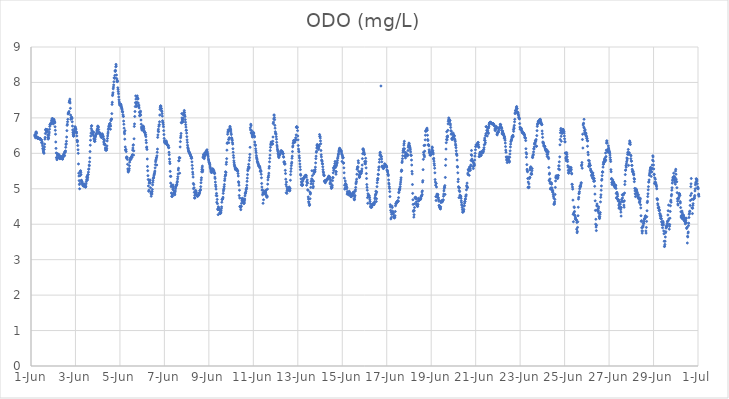
| Category | ODO (mg/L) |
|---|---|
| 45078.166666666664 | 6.49 |
| 45078.177083333336 | 6.53 |
| 45078.1875 | 6.51 |
| 45078.197916666664 | 6.44 |
| 45078.208333333336 | 6.49 |
| 45078.21875 | 6.6 |
| 45078.229166666664 | 6.59 |
| 45078.239583333336 | 6.6 |
| 45078.25 | 6.56 |
| 45078.260416666664 | 6.47 |
| 45078.270833333336 | 6.44 |
| 45078.28125 | 6.43 |
| 45078.291666666664 | 6.43 |
| 45078.302083333336 | 6.43 |
| 45078.3125 | 6.42 |
| 45078.322916666664 | 6.44 |
| 45078.333333333336 | 6.43 |
| 45078.34375 | 6.42 |
| 45078.354166666664 | 6.43 |
| 45078.364583333336 | 6.42 |
| 45078.375 | 6.42 |
| 45078.385416666664 | 6.41 |
| 45078.395833333336 | 6.4 |
| 45078.40625 | 6.42 |
| 45078.416666666664 | 6.41 |
| 45078.427083333336 | 6.41 |
| 45078.4375 | 6.39 |
| 45078.447916666664 | 6.39 |
| 45078.458333333336 | 6.38 |
| 45078.46875 | 6.37 |
| 45078.479166666664 | 6.3 |
| 45078.489583333336 | 6.31 |
| 45078.5 | 6.32 |
| 45078.510416666664 | 6.27 |
| 45078.520833333336 | 6.21 |
| 45078.53125 | 6.14 |
| 45078.541666666664 | 6.12 |
| 45078.552083333336 | 6.07 |
| 45078.5625 | 6.04 |
| 45078.572916666664 | 6.02 |
| 45078.583333333336 | 6 |
| 45078.59375 | 6.11 |
| 45078.604166666664 | 6.18 |
| 45078.614583333336 | 6.26 |
| 45078.625 | 6.4 |
| 45078.635416666664 | 6.45 |
| 45078.645833333336 | 6.56 |
| 45078.65625 | 6.66 |
| 45078.666666666664 | 6.68 |
| 45078.677083333336 | 6.67 |
| 45078.6875 | 6.65 |
| 45078.697916666664 | 6.61 |
| 45078.708333333336 | 6.61 |
| 45078.71875 | 6.62 |
| 45078.729166666664 | 6.67 |
| 45078.739583333336 | 6.65 |
| 45078.75 | 6.52 |
| 45078.760416666664 | 6.45 |
| 45078.770833333336 | 6.4 |
| 45078.78125 | 6.42 |
| 45078.791666666664 | 6.43 |
| 45078.802083333336 | 6.5 |
| 45078.8125 | 6.55 |
| 45078.822916666664 | 6.6 |
| 45078.833333333336 | 6.68 |
| 45078.84375 | 6.76 |
| 45078.854166666664 | 6.81 |
| 45078.864583333336 | 6.82 |
| 45078.875 | 6.81 |
| 45078.885416666664 | 6.84 |
| 45078.895833333336 | 6.85 |
| 45078.90625 | 6.85 |
| 45078.916666666664 | 6.87 |
| 45078.927083333336 | 6.92 |
| 45078.9375 | 6.94 |
| 45078.947916666664 | 6.97 |
| 45078.958333333336 | 6.98 |
| 45078.96875 | 6.98 |
| 45078.979166666664 | 6.97 |
| 45078.989583333336 | 6.9 |
| 45079.0 | 6.83 |
| 45079.010416666664 | 6.85 |
| 45079.020833333336 | 6.95 |
| 45079.03125 | 6.96 |
| 45079.041666666664 | 6.92 |
| 45079.052083333336 | 6.89 |
| 45079.0625 | 6.89 |
| 45079.072916666664 | 6.86 |
| 45079.083333333336 | 6.75 |
| 45079.09375 | 6.65 |
| 45079.104166666664 | 6.54 |
| 45079.114583333336 | 6.32 |
| 45079.125 | 6.14 |
| 45079.135416666664 | 6.01 |
| 45079.145833333336 | 5.88 |
| 45079.15625 | 5.88 |
| 45079.166666666664 | 5.82 |
| 45079.177083333336 | 5.86 |
| 45079.1875 | 5.95 |
| 45079.197916666664 | 5.99 |
| 45079.208333333336 | 5.96 |
| 45079.21875 | 5.97 |
| 45079.229166666664 | 5.89 |
| 45079.239583333336 | 5.96 |
| 45079.25 | 5.95 |
| 45079.260416666664 | 5.96 |
| 45079.270833333336 | 5.87 |
| 45079.28125 | 5.89 |
| 45079.291666666664 | 5.85 |
| 45079.302083333336 | 5.86 |
| 45079.3125 | 5.85 |
| 45079.322916666664 | 5.87 |
| 45079.333333333336 | 5.9 |
| 45079.34375 | 5.91 |
| 45079.354166666664 | 5.91 |
| 45079.364583333336 | 5.89 |
| 45079.375 | 5.86 |
| 45079.385416666664 | 5.85 |
| 45079.395833333336 | 5.85 |
| 45079.40625 | 5.85 |
| 45079.416666666664 | 5.84 |
| 45079.427083333336 | 5.84 |
| 45079.4375 | 5.88 |
| 45079.447916666664 | 5.91 |
| 45079.458333333336 | 5.94 |
| 45079.46875 | 5.96 |
| 45079.479166666664 | 5.98 |
| 45079.489583333336 | 6 |
| 45079.5 | 5.93 |
| 45079.510416666664 | 5.94 |
| 45079.520833333336 | 6.04 |
| 45079.53125 | 6.05 |
| 45079.541666666664 | 6.03 |
| 45079.552083333336 | 6.07 |
| 45079.5625 | 6.17 |
| 45079.572916666664 | 6.25 |
| 45079.583333333336 | 6.27 |
| 45079.59375 | 6.34 |
| 45079.604166666664 | 6.46 |
| 45079.614583333336 | 6.64 |
| 45079.625 | 6.79 |
| 45079.635416666664 | 6.82 |
| 45079.645833333336 | 6.89 |
| 45079.65625 | 6.96 |
| 45079.666666666664 | 7.11 |
| 45079.677083333336 | 7.14 |
| 45079.6875 | 7.13 |
| 45079.697916666664 | 7.14 |
| 45079.708333333336 | 7.18 |
| 45079.71875 | 7.44 |
| 45079.729166666664 | 7.48 |
| 45079.739583333336 | 7.46 |
| 45079.75 | 7.53 |
| 45079.760416666664 | 7.42 |
| 45079.770833333336 | 7.27 |
| 45079.78125 | 7.08 |
| 45079.791666666664 | 6.96 |
| 45079.802083333336 | 7 |
| 45079.8125 | 7 |
| 45079.822916666664 | 7.02 |
| 45079.833333333336 | 7.01 |
| 45079.84375 | 6.98 |
| 45079.854166666664 | 6.89 |
| 45079.864583333336 | 6.77 |
| 45079.875 | 6.66 |
| 45079.885416666664 | 6.59 |
| 45079.895833333336 | 6.54 |
| 45079.90625 | 6.49 |
| 45079.916666666664 | 6.49 |
| 45079.927083333336 | 6.49 |
| 45079.9375 | 6.55 |
| 45079.947916666664 | 6.6 |
| 45079.958333333336 | 6.63 |
| 45079.96875 | 6.7 |
| 45079.979166666664 | 6.75 |
| 45079.989583333336 | 6.74 |
| 45080.0 | 6.71 |
| 45080.010416666664 | 6.69 |
| 45080.020833333336 | 6.68 |
| 45080.03125 | 6.61 |
| 45080.041666666664 | 6.6 |
| 45080.052083333336 | 6.57 |
| 45080.0625 | 6.49 |
| 45080.072916666664 | 6.37 |
| 45080.083333333336 | 6.32 |
| 45080.09375 | 6.35 |
| 45080.104166666664 | 6.22 |
| 45080.114583333336 | 6.1 |
| 45080.125 | 6 |
| 45080.135416666664 | 5.7 |
| 45080.145833333336 | 5.44 |
| 45080.15625 | 5.36 |
| 45080.166666666664 | 5.23 |
| 45080.177083333336 | 5.12 |
| 45080.1875 | 5 |
| 45080.197916666664 | 5.15 |
| 45080.208333333336 | 5.37 |
| 45080.21875 | 5.49 |
| 45080.229166666664 | 5.51 |
| 45080.239583333336 | 5.46 |
| 45080.25 | 5.4 |
| 45080.260416666664 | 5.23 |
| 45080.270833333336 | 5.24 |
| 45080.28125 | 5.21 |
| 45080.291666666664 | 5.18 |
| 45080.302083333336 | 5.19 |
| 45080.3125 | 5.14 |
| 45080.322916666664 | 5.12 |
| 45080.333333333336 | 5.09 |
| 45080.34375 | 5.11 |
| 45080.354166666664 | 5.1 |
| 45080.364583333336 | 5.07 |
| 45080.375 | 5.12 |
| 45080.385416666664 | 5.13 |
| 45080.395833333336 | 5.13 |
| 45080.40625 | 5.1 |
| 45080.416666666664 | 5.08 |
| 45080.427083333336 | 5.08 |
| 45080.4375 | 5.06 |
| 45080.447916666664 | 5.05 |
| 45080.458333333336 | 5.05 |
| 45080.46875 | 5.07 |
| 45080.479166666664 | 5.14 |
| 45080.489583333336 | 5.2 |
| 45080.5 | 5.25 |
| 45080.510416666664 | 5.31 |
| 45080.520833333336 | 5.35 |
| 45080.53125 | 5.35 |
| 45080.541666666664 | 5.25 |
| 45080.552083333336 | 5.31 |
| 45080.5625 | 5.4 |
| 45080.572916666664 | 5.4 |
| 45080.583333333336 | 5.47 |
| 45080.59375 | 5.55 |
| 45080.604166666664 | 5.56 |
| 45080.614583333336 | 5.67 |
| 45080.625 | 5.65 |
| 45080.635416666664 | 5.76 |
| 45080.645833333336 | 5.87 |
| 45080.65625 | 6.05 |
| 45080.666666666664 | 6.23 |
| 45080.677083333336 | 6.37 |
| 45080.6875 | 6.49 |
| 45080.697916666664 | 6.57 |
| 45080.708333333336 | 6.7 |
| 45080.71875 | 6.77 |
| 45080.729166666664 | 6.78 |
| 45080.739583333336 | 6.65 |
| 45080.75 | 6.62 |
| 45080.760416666664 | 6.55 |
| 45080.770833333336 | 6.54 |
| 45080.78125 | 6.55 |
| 45080.791666666664 | 6.55 |
| 45080.802083333336 | 6.59 |
| 45080.8125 | 6.6 |
| 45080.822916666664 | 6.49 |
| 45080.833333333336 | 6.42 |
| 45080.84375 | 6.39 |
| 45080.854166666664 | 6.34 |
| 45080.864583333336 | 6.34 |
| 45080.875 | 6.34 |
| 45080.885416666664 | 6.4 |
| 45080.895833333336 | 6.46 |
| 45080.90625 | 6.49 |
| 45080.916666666664 | 6.52 |
| 45080.927083333336 | 6.54 |
| 45080.9375 | 6.54 |
| 45080.947916666664 | 6.56 |
| 45080.958333333336 | 6.6 |
| 45080.96875 | 6.65 |
| 45080.979166666664 | 6.66 |
| 45080.989583333336 | 6.7 |
| 45081.0 | 6.76 |
| 45081.010416666664 | 6.77 |
| 45081.020833333336 | 6.74 |
| 45081.03125 | 6.74 |
| 45081.041666666664 | 6.67 |
| 45081.052083333336 | 6.6 |
| 45081.0625 | 6.56 |
| 45081.072916666664 | 6.58 |
| 45081.083333333336 | 6.57 |
| 45081.09375 | 6.58 |
| 45081.104166666664 | 6.56 |
| 45081.114583333336 | 6.55 |
| 45081.125 | 6.53 |
| 45081.135416666664 | 6.5 |
| 45081.145833333336 | 6.48 |
| 45081.15625 | 6.46 |
| 45081.166666666664 | 6.45 |
| 45081.177083333336 | 6.45 |
| 45081.1875 | 6.47 |
| 45081.197916666664 | 6.55 |
| 45081.208333333336 | 6.54 |
| 45081.21875 | 6.52 |
| 45081.229166666664 | 6.5 |
| 45081.239583333336 | 6.46 |
| 45081.25 | 6.47 |
| 45081.260416666664 | 6.4 |
| 45081.270833333336 | 6.32 |
| 45081.28125 | 6.26 |
| 45081.291666666664 | 6.39 |
| 45081.302083333336 | 6.35 |
| 45081.3125 | 6.27 |
| 45081.322916666664 | 6.25 |
| 45081.333333333336 | 6.23 |
| 45081.34375 | 6.15 |
| 45081.354166666664 | 6.09 |
| 45081.364583333336 | 6.11 |
| 45081.375 | 6.13 |
| 45081.385416666664 | 6.09 |
| 45081.395833333336 | 6.09 |
| 45081.40625 | 6.14 |
| 45081.416666666664 | 6.21 |
| 45081.427083333336 | 6.35 |
| 45081.4375 | 6.42 |
| 45081.447916666664 | 6.49 |
| 45081.458333333336 | 6.55 |
| 45081.46875 | 6.6 |
| 45081.479166666664 | 6.67 |
| 45081.489583333336 | 6.7 |
| 45081.5 | 6.75 |
| 45081.510416666664 | 6.77 |
| 45081.520833333336 | 6.78 |
| 45081.53125 | 6.81 |
| 45081.541666666664 | 6.84 |
| 45081.552083333336 | 6.84 |
| 45081.5625 | 6.8 |
| 45081.572916666664 | 6.68 |
| 45081.583333333336 | 6.77 |
| 45081.59375 | 6.92 |
| 45081.604166666664 | 6.95 |
| 45081.614583333336 | 6.96 |
| 45081.625 | 6.97 |
| 45081.635416666664 | 7.12 |
| 45081.645833333336 | 7.38 |
| 45081.65625 | 7.44 |
| 45081.666666666664 | 7.63 |
| 45081.677083333336 | 7.67 |
| 45081.6875 | 7.71 |
| 45081.697916666664 | 7.82 |
| 45081.708333333336 | 7.87 |
| 45081.71875 | 7.93 |
| 45081.729166666664 | 8.02 |
| 45081.739583333336 | 8.13 |
| 45081.75 | 8.12 |
| 45081.760416666664 | 8.13 |
| 45081.770833333336 | 8.2 |
| 45081.78125 | 8.33 |
| 45081.791666666664 | 8.31 |
| 45081.802083333336 | 8.34 |
| 45081.8125 | 8.44 |
| 45081.822916666664 | 8.51 |
| 45081.833333333336 | 8.46 |
| 45081.84375 | 8.21 |
| 45081.854166666664 | 8.11 |
| 45081.864583333336 | 8.07 |
| 45081.875 | 8.02 |
| 45081.885416666664 | 8.04 |
| 45081.895833333336 | 8.03 |
| 45081.90625 | 7.85 |
| 45081.916666666664 | 7.8 |
| 45081.927083333336 | 7.74 |
| 45081.9375 | 7.68 |
| 45081.947916666664 | 7.59 |
| 45081.958333333336 | 7.51 |
| 45081.96875 | 7.45 |
| 45081.979166666664 | 7.41 |
| 45081.989583333336 | 7.37 |
| 45082.0 | 7.36 |
| 45082.010416666664 | 7.36 |
| 45082.020833333336 | 7.37 |
| 45082.03125 | 7.39 |
| 45082.041666666664 | 7.38 |
| 45082.052083333336 | 7.35 |
| 45082.0625 | 7.32 |
| 45082.072916666664 | 7.29 |
| 45082.083333333336 | 7.27 |
| 45082.09375 | 7.24 |
| 45082.104166666664 | 7.19 |
| 45082.114583333336 | 7.17 |
| 45082.125 | 7.17 |
| 45082.135416666664 | 7.09 |
| 45082.145833333336 | 7.05 |
| 45082.15625 | 7.04 |
| 45082.166666666664 | 6.91 |
| 45082.177083333336 | 6.82 |
| 45082.1875 | 6.71 |
| 45082.197916666664 | 6.6 |
| 45082.208333333336 | 6.55 |
| 45082.21875 | 6.4 |
| 45082.229166666664 | 6.64 |
| 45082.239583333336 | 6.18 |
| 45082.25 | 6.1 |
| 45082.260416666664 | 6.09 |
| 45082.270833333336 | 6.11 |
| 45082.28125 | 6.05 |
| 45082.291666666664 | 5.87 |
| 45082.302083333336 | 5.9 |
| 45082.3125 | 5.88 |
| 45082.322916666664 | 5.89 |
| 45082.333333333336 | 5.83 |
| 45082.34375 | 5.69 |
| 45082.354166666664 | 5.56 |
| 45082.364583333336 | 5.5 |
| 45082.375 | 5.47 |
| 45082.385416666664 | 5.54 |
| 45082.395833333336 | 5.54 |
| 45082.40625 | 5.51 |
| 45082.416666666664 | 5.57 |
| 45082.427083333336 | 5.65 |
| 45082.4375 | 5.75 |
| 45082.447916666664 | 5.8 |
| 45082.458333333336 | 5.86 |
| 45082.46875 | 5.84 |
| 45082.479166666664 | 5.84 |
| 45082.489583333336 | 5.83 |
| 45082.5 | 5.85 |
| 45082.510416666664 | 5.89 |
| 45082.520833333336 | 5.91 |
| 45082.53125 | 5.89 |
| 45082.541666666664 | 5.89 |
| 45082.552083333336 | 5.95 |
| 45082.5625 | 5.96 |
| 45082.572916666664 | 6.09 |
| 45082.583333333336 | 6.15 |
| 45082.59375 | 6.23 |
| 45082.604166666664 | 6.24 |
| 45082.614583333336 | 5.95 |
| 45082.625 | 6.07 |
| 45082.635416666664 | 6.41 |
| 45082.645833333336 | 6.76 |
| 45082.65625 | 6.83 |
| 45082.666666666664 | 7.04 |
| 45082.677083333336 | 7.18 |
| 45082.6875 | 7.32 |
| 45082.697916666664 | 7.43 |
| 45082.708333333336 | 7.62 |
| 45082.71875 | 7.53 |
| 45082.729166666664 | 7.42 |
| 45082.739583333336 | 7.37 |
| 45082.75 | 7.32 |
| 45082.760416666664 | 7.44 |
| 45082.770833333336 | 7.58 |
| 45082.78125 | 7.62 |
| 45082.791666666664 | 7.56 |
| 45082.802083333336 | 7.53 |
| 45082.8125 | 7.54 |
| 45082.822916666664 | 7.42 |
| 45082.833333333336 | 7.34 |
| 45082.84375 | 7.33 |
| 45082.854166666664 | 7.36 |
| 45082.864583333336 | 7.28 |
| 45082.875 | 7.16 |
| 45082.885416666664 | 7.06 |
| 45082.895833333336 | 7.07 |
| 45082.90625 | 7.11 |
| 45082.916666666664 | 7.16 |
| 45082.927083333336 | 7.19 |
| 45082.9375 | 7.08 |
| 45082.947916666664 | 6.94 |
| 45082.958333333336 | 6.82 |
| 45082.96875 | 6.74 |
| 45082.979166666664 | 6.7 |
| 45082.989583333336 | 6.68 |
| 45083.0 | 6.65 |
| 45083.010416666664 | 6.67 |
| 45083.020833333336 | 6.72 |
| 45083.03125 | 6.76 |
| 45083.041666666664 | 6.77 |
| 45083.052083333336 | 6.76 |
| 45083.0625 | 6.74 |
| 45083.072916666664 | 6.7 |
| 45083.083333333336 | 6.65 |
| 45083.09375 | 6.62 |
| 45083.104166666664 | 6.59 |
| 45083.114583333336 | 6.59 |
| 45083.125 | 6.59 |
| 45083.135416666664 | 6.58 |
| 45083.145833333336 | 6.52 |
| 45083.15625 | 6.53 |
| 45083.166666666664 | 6.47 |
| 45083.177083333336 | 6.37 |
| 45083.1875 | 6.3 |
| 45083.197916666664 | 6.16 |
| 45083.208333333336 | 6.18 |
| 45083.21875 | 6.11 |
| 45083.229166666664 | 5.84 |
| 45083.239583333336 | 5.63 |
| 45083.25 | 5.51 |
| 45083.260416666664 | 5.37 |
| 45083.270833333336 | 5.26 |
| 45083.28125 | 5.08 |
| 45083.291666666664 | 4.93 |
| 45083.302083333336 | 4.96 |
| 45083.3125 | 5.16 |
| 45083.322916666664 | 5.19 |
| 45083.333333333336 | 5.23 |
| 45083.34375 | 5.24 |
| 45083.354166666664 | 5.25 |
| 45083.364583333336 | 5.16 |
| 45083.375 | 5.03 |
| 45083.385416666664 | 4.91 |
| 45083.395833333336 | 4.86 |
| 45083.40625 | 4.79 |
| 45083.416666666664 | 4.91 |
| 45083.427083333336 | 4.87 |
| 45083.4375 | 4.85 |
| 45083.447916666664 | 4.92 |
| 45083.458333333336 | 4.98 |
| 45083.46875 | 5.11 |
| 45083.479166666664 | 5.18 |
| 45083.489583333336 | 5.23 |
| 45083.5 | 5.29 |
| 45083.510416666664 | 5.31 |
| 45083.520833333336 | 5.33 |
| 45083.53125 | 5.38 |
| 45083.541666666664 | 5.41 |
| 45083.552083333336 | 5.43 |
| 45083.5625 | 5.47 |
| 45083.572916666664 | 5.5 |
| 45083.583333333336 | 5.59 |
| 45083.59375 | 5.68 |
| 45083.604166666664 | 5.76 |
| 45083.614583333336 | 5.8 |
| 45083.625 | 5.83 |
| 45083.635416666664 | 5.87 |
| 45083.645833333336 | 5.88 |
| 45083.65625 | 5.67 |
| 45083.666666666664 | 5.93 |
| 45083.677083333336 | 6.03 |
| 45083.6875 | 6.12 |
| 45083.697916666664 | 6.45 |
| 45083.708333333336 | 6.52 |
| 45083.71875 | 6.63 |
| 45083.729166666664 | 6.68 |
| 45083.739583333336 | 6.61 |
| 45083.75 | 6.76 |
| 45083.760416666664 | 6.8 |
| 45083.770833333336 | 6.81 |
| 45083.78125 | 6.89 |
| 45083.791666666664 | 7.08 |
| 45083.802083333336 | 7.24 |
| 45083.8125 | 7.3 |
| 45083.822916666664 | 7.33 |
| 45083.833333333336 | 7.34 |
| 45083.84375 | 7.33 |
| 45083.854166666664 | 7.27 |
| 45083.864583333336 | 7.26 |
| 45083.875 | 7.2 |
| 45083.885416666664 | 7.18 |
| 45083.895833333336 | 7.12 |
| 45083.90625 | 7.05 |
| 45083.916666666664 | 6.92 |
| 45083.927083333336 | 6.88 |
| 45083.9375 | 6.86 |
| 45083.947916666664 | 6.81 |
| 45083.958333333336 | 6.75 |
| 45083.96875 | 6.64 |
| 45083.979166666664 | 6.53 |
| 45083.989583333336 | 6.42 |
| 45084.0 | 6.35 |
| 45084.010416666664 | 6.32 |
| 45084.020833333336 | 6.31 |
| 45084.03125 | 6.29 |
| 45084.041666666664 | 6.28 |
| 45084.052083333336 | 6.31 |
| 45084.0625 | 6.35 |
| 45084.072916666664 | 6.35 |
| 45084.083333333336 | 6.34 |
| 45084.09375 | 6.31 |
| 45084.104166666664 | 6.29 |
| 45084.114583333336 | 6.26 |
| 45084.125 | 6.25 |
| 45084.135416666664 | 6.23 |
| 45084.145833333336 | 6.23 |
| 45084.15625 | 6.22 |
| 45084.166666666664 | 6.23 |
| 45084.177083333336 | 6.21 |
| 45084.1875 | 6.16 |
| 45084.197916666664 | 6.16 |
| 45084.208333333336 | 6.03 |
| 45084.21875 | 5.96 |
| 45084.229166666664 | 5.84 |
| 45084.239583333336 | 5.76 |
| 45084.25 | 5.71 |
| 45084.260416666664 | 5.49 |
| 45084.270833333336 | 5.35 |
| 45084.28125 | 5.16 |
| 45084.291666666664 | 5.35 |
| 45084.302083333336 | 5.06 |
| 45084.3125 | 4.88 |
| 45084.322916666664 | 5.1 |
| 45084.333333333336 | 4.79 |
| 45084.34375 | 4.78 |
| 45084.354166666664 | 4.85 |
| 45084.364583333336 | 4.8 |
| 45084.375 | 4.99 |
| 45084.385416666664 | 5.11 |
| 45084.395833333336 | 5.06 |
| 45084.40625 | 5.02 |
| 45084.416666666664 | 4.95 |
| 45084.427083333336 | 4.89 |
| 45084.4375 | 4.85 |
| 45084.447916666664 | 4.87 |
| 45084.458333333336 | 4.86 |
| 45084.46875 | 4.83 |
| 45084.479166666664 | 4.91 |
| 45084.489583333336 | 4.94 |
| 45084.5 | 5 |
| 45084.510416666664 | 5.05 |
| 45084.520833333336 | 5.07 |
| 45084.53125 | 5.09 |
| 45084.541666666664 | 5.1 |
| 45084.552083333336 | 5.11 |
| 45084.5625 | 5.13 |
| 45084.572916666664 | 5.18 |
| 45084.583333333336 | 5.21 |
| 45084.59375 | 5.28 |
| 45084.604166666664 | 5.34 |
| 45084.614583333336 | 5.42 |
| 45084.625 | 5.53 |
| 45084.635416666664 | 5.58 |
| 45084.645833333336 | 5.79 |
| 45084.65625 | 5.79 |
| 45084.666666666664 | 5.88 |
| 45084.677083333336 | 5.87 |
| 45084.6875 | 5.44 |
| 45084.697916666664 | 5.87 |
| 45084.708333333336 | 6.18 |
| 45084.71875 | 6.33 |
| 45084.729166666664 | 6.44 |
| 45084.739583333336 | 6.49 |
| 45084.75 | 6.56 |
| 45084.760416666664 | 6.87 |
| 45084.770833333336 | 6.86 |
| 45084.78125 | 7.12 |
| 45084.791666666664 | 7 |
| 45084.802083333336 | 6.94 |
| 45084.8125 | 6.95 |
| 45084.822916666664 | 6.88 |
| 45084.833333333336 | 6.9 |
| 45084.84375 | 6.99 |
| 45084.854166666664 | 7.08 |
| 45084.864583333336 | 7.11 |
| 45084.875 | 7.15 |
| 45084.885416666664 | 7.16 |
| 45084.895833333336 | 7.21 |
| 45084.90625 | 7.15 |
| 45084.916666666664 | 7.08 |
| 45084.927083333336 | 7.04 |
| 45084.9375 | 6.95 |
| 45084.947916666664 | 6.88 |
| 45084.958333333336 | 6.81 |
| 45084.96875 | 6.74 |
| 45084.979166666664 | 6.65 |
| 45084.989583333336 | 6.65 |
| 45085.0 | 6.57 |
| 45085.010416666664 | 6.47 |
| 45085.020833333336 | 6.38 |
| 45085.03125 | 6.31 |
| 45085.041666666664 | 6.23 |
| 45085.052083333336 | 6.17 |
| 45085.0625 | 6.14 |
| 45085.072916666664 | 6.12 |
| 45085.083333333336 | 6.08 |
| 45085.09375 | 6.05 |
| 45085.104166666664 | 6.05 |
| 45085.114583333336 | 6.02 |
| 45085.125 | 6.02 |
| 45085.135416666664 | 6.01 |
| 45085.145833333336 | 5.99 |
| 45085.15625 | 5.97 |
| 45085.166666666664 | 5.96 |
| 45085.177083333336 | 5.94 |
| 45085.1875 | 5.92 |
| 45085.197916666664 | 5.91 |
| 45085.208333333336 | 5.86 |
| 45085.21875 | 5.89 |
| 45085.229166666664 | 5.86 |
| 45085.239583333336 | 5.76 |
| 45085.25 | 5.66 |
| 45085.260416666664 | 5.57 |
| 45085.270833333336 | 5.47 |
| 45085.28125 | 5.41 |
| 45085.291666666664 | 5.33 |
| 45085.302083333336 | 5.15 |
| 45085.3125 | 5 |
| 45085.322916666664 | 5.12 |
| 45085.333333333336 | 5.03 |
| 45085.34375 | 4.9 |
| 45085.354166666664 | 4.74 |
| 45085.364583333336 | 4.81 |
| 45085.375 | 4.74 |
| 45085.385416666664 | 4.85 |
| 45085.395833333336 | 4.9 |
| 45085.40625 | 4.95 |
| 45085.416666666664 | 4.94 |
| 45085.427083333336 | 4.91 |
| 45085.4375 | 4.89 |
| 45085.447916666664 | 4.84 |
| 45085.458333333336 | 4.81 |
| 45085.46875 | 4.8 |
| 45085.479166666664 | 4.82 |
| 45085.489583333336 | 4.79 |
| 45085.5 | 4.79 |
| 45085.510416666664 | 4.82 |
| 45085.520833333336 | 4.82 |
| 45085.53125 | 4.82 |
| 45085.541666666664 | 4.83 |
| 45085.552083333336 | 4.83 |
| 45085.5625 | 4.86 |
| 45085.572916666664 | 4.88 |
| 45085.583333333336 | 4.89 |
| 45085.59375 | 4.94 |
| 45085.604166666664 | 4.95 |
| 45085.614583333336 | 4.96 |
| 45085.625 | 4.98 |
| 45085.635416666664 | 5.06 |
| 45085.645833333336 | 5.17 |
| 45085.65625 | 5.25 |
| 45085.666666666664 | 5.31 |
| 45085.677083333336 | 5.48 |
| 45085.6875 | 5.54 |
| 45085.697916666664 | 5.59 |
| 45085.708333333336 | 5.64 |
| 45085.71875 | 5.48 |
| 45085.729166666664 | 5.53 |
| 45085.739583333336 | 5.88 |
| 45085.75 | 5.91 |
| 45085.760416666664 | 5.97 |
| 45085.770833333336 | 5.93 |
| 45085.78125 | 5.96 |
| 45085.791666666664 | 5.85 |
| 45085.802083333336 | 5.9 |
| 45085.8125 | 5.92 |
| 45085.822916666664 | 6.02 |
| 45085.833333333336 | 6 |
| 45085.84375 | 5.96 |
| 45085.854166666664 | 5.98 |
| 45085.864583333336 | 5.99 |
| 45085.875 | 6.01 |
| 45085.885416666664 | 6.07 |
| 45085.895833333336 | 6.07 |
| 45085.90625 | 6.05 |
| 45085.916666666664 | 6.1 |
| 45085.927083333336 | 6.04 |
| 45085.9375 | 5.96 |
| 45085.947916666664 | 6 |
| 45085.958333333336 | 5.95 |
| 45085.96875 | 5.9 |
| 45085.979166666664 | 5.84 |
| 45085.989583333336 | 5.81 |
| 45086.0 | 5.78 |
| 45086.010416666664 | 5.74 |
| 45086.020833333336 | 5.73 |
| 45086.03125 | 5.71 |
| 45086.041666666664 | 5.68 |
| 45086.052083333336 | 5.64 |
| 45086.0625 | 5.6 |
| 45086.072916666664 | 5.57 |
| 45086.083333333336 | 5.53 |
| 45086.09375 | 5.49 |
| 45086.104166666664 | 5.47 |
| 45086.114583333336 | 5.46 |
| 45086.125 | 5.46 |
| 45086.135416666664 | 5.48 |
| 45086.145833333336 | 5.5 |
| 45086.15625 | 5.52 |
| 45086.166666666664 | 5.56 |
| 45086.177083333336 | 5.56 |
| 45086.1875 | 5.55 |
| 45086.197916666664 | 5.52 |
| 45086.208333333336 | 5.52 |
| 45086.21875 | 5.51 |
| 45086.229166666664 | 5.49 |
| 45086.239583333336 | 5.44 |
| 45086.25 | 5.45 |
| 45086.260416666664 | 5.43 |
| 45086.270833333336 | 5.33 |
| 45086.28125 | 5.29 |
| 45086.291666666664 | 5.19 |
| 45086.302083333336 | 5.11 |
| 45086.3125 | 5.06 |
| 45086.322916666664 | 4.99 |
| 45086.333333333336 | 4.81 |
| 45086.34375 | 4.87 |
| 45086.354166666664 | 4.62 |
| 45086.364583333336 | 4.8 |
| 45086.375 | 4.7 |
| 45086.385416666664 | 4.58 |
| 45086.395833333336 | 4.43 |
| 45086.40625 | 4.41 |
| 45086.416666666664 | 4.27 |
| 45086.427083333336 | 4.49 |
| 45086.4375 | 4.44 |
| 45086.447916666664 | 4.46 |
| 45086.458333333336 | 4.41 |
| 45086.46875 | 4.41 |
| 45086.479166666664 | 4.41 |
| 45086.489583333336 | 4.33 |
| 45086.5 | 4.3 |
| 45086.510416666664 | 4.3 |
| 45086.520833333336 | 4.34 |
| 45086.53125 | 4.32 |
| 45086.541666666664 | 4.32 |
| 45086.552083333336 | 4.38 |
| 45086.5625 | 4.44 |
| 45086.572916666664 | 4.49 |
| 45086.583333333336 | 4.62 |
| 45086.59375 | 4.7 |
| 45086.604166666664 | 4.7 |
| 45086.614583333336 | 4.71 |
| 45086.625 | 4.72 |
| 45086.635416666664 | 4.76 |
| 45086.645833333336 | 4.87 |
| 45086.65625 | 4.94 |
| 45086.666666666664 | 4.98 |
| 45086.677083333336 | 5.01 |
| 45086.6875 | 5.06 |
| 45086.697916666664 | 5.12 |
| 45086.708333333336 | 5.23 |
| 45086.71875 | 5.28 |
| 45086.729166666664 | 5.35 |
| 45086.739583333336 | 5.39 |
| 45086.75 | 5.48 |
| 45086.760416666664 | 5.39 |
| 45086.770833333336 | 5.46 |
| 45086.78125 | 5.69 |
| 45086.791666666664 | 5.75 |
| 45086.802083333336 | 5.85 |
| 45086.8125 | 6.09 |
| 45086.822916666664 | 6.28 |
| 45086.833333333336 | 6.3 |
| 45086.84375 | 6.54 |
| 45086.854166666664 | 6.6 |
| 45086.864583333336 | 6.66 |
| 45086.875 | 6.61 |
| 45086.885416666664 | 6.39 |
| 45086.895833333336 | 6.3 |
| 45086.90625 | 6.4 |
| 45086.916666666664 | 6.44 |
| 45086.927083333336 | 6.65 |
| 45086.9375 | 6.71 |
| 45086.947916666664 | 6.76 |
| 45086.958333333336 | 6.74 |
| 45086.96875 | 6.68 |
| 45086.979166666664 | 6.68 |
| 45086.989583333336 | 6.63 |
| 45087.0 | 6.57 |
| 45087.010416666664 | 6.53 |
| 45087.020833333336 | 6.44 |
| 45087.03125 | 6.42 |
| 45087.041666666664 | 6.39 |
| 45087.052083333336 | 6.36 |
| 45087.0625 | 6.3 |
| 45087.072916666664 | 6.26 |
| 45087.083333333336 | 6.13 |
| 45087.09375 | 6.03 |
| 45087.104166666664 | 5.94 |
| 45087.114583333336 | 5.88 |
| 45087.125 | 5.79 |
| 45087.135416666664 | 5.74 |
| 45087.145833333336 | 5.69 |
| 45087.15625 | 5.65 |
| 45087.166666666664 | 5.63 |
| 45087.177083333336 | 5.59 |
| 45087.1875 | 5.56 |
| 45087.197916666664 | 5.54 |
| 45087.208333333336 | 5.55 |
| 45087.21875 | 5.56 |
| 45087.229166666664 | 5.57 |
| 45087.239583333336 | 5.56 |
| 45087.25 | 5.56 |
| 45087.260416666664 | 5.55 |
| 45087.270833333336 | 5.53 |
| 45087.28125 | 5.5 |
| 45087.291666666664 | 5.51 |
| 45087.302083333336 | 5.5 |
| 45087.3125 | 5.43 |
| 45087.322916666664 | 5.36 |
| 45087.333333333336 | 5.2 |
| 45087.34375 | 5.17 |
| 45087.354166666664 | 5.1 |
| 45087.364583333336 | 4.81 |
| 45087.375 | 4.96 |
| 45087.385416666664 | 4.74 |
| 45087.395833333336 | 4.5 |
| 45087.40625 | 4.49 |
| 45087.416666666664 | 4.51 |
| 45087.427083333336 | 4.47 |
| 45087.4375 | 4.41 |
| 45087.447916666664 | 4.5 |
| 45087.458333333336 | 4.51 |
| 45087.46875 | 4.59 |
| 45087.479166666664 | 4.72 |
| 45087.489583333336 | 4.66 |
| 45087.5 | 4.68 |
| 45087.510416666664 | 4.71 |
| 45087.520833333336 | 4.73 |
| 45087.53125 | 4.67 |
| 45087.541666666664 | 4.63 |
| 45087.552083333336 | 4.64 |
| 45087.5625 | 4.61 |
| 45087.572916666664 | 4.58 |
| 45087.583333333336 | 4.6 |
| 45087.59375 | 4.6 |
| 45087.604166666664 | 4.66 |
| 45087.614583333336 | 4.71 |
| 45087.625 | 4.8 |
| 45087.635416666664 | 4.86 |
| 45087.645833333336 | 4.89 |
| 45087.65625 | 4.88 |
| 45087.666666666664 | 4.93 |
| 45087.677083333336 | 4.98 |
| 45087.6875 | 5 |
| 45087.697916666664 | 5.03 |
| 45087.708333333336 | 5.1 |
| 45087.71875 | 5.21 |
| 45087.729166666664 | 5.3 |
| 45087.739583333336 | 5.4 |
| 45087.75 | 5.51 |
| 45087.760416666664 | 5.55 |
| 45087.770833333336 | 5.57 |
| 45087.78125 | 5.62 |
| 45087.791666666664 | 5.69 |
| 45087.802083333336 | 5.58 |
| 45087.8125 | 5.61 |
| 45087.822916666664 | 5.8 |
| 45087.833333333336 | 5.88 |
| 45087.84375 | 5.97 |
| 45087.854166666664 | 6.17 |
| 45087.864583333336 | 6.72 |
| 45087.875 | 6.66 |
| 45087.885416666664 | 6.82 |
| 45087.895833333336 | 6.78 |
| 45087.90625 | 6.58 |
| 45087.916666666664 | 6.56 |
| 45087.927083333336 | 6.64 |
| 45087.9375 | 6.58 |
| 45087.947916666664 | 6.49 |
| 45087.958333333336 | 6.46 |
| 45087.96875 | 6.52 |
| 45087.979166666664 | 6.52 |
| 45087.989583333336 | 6.56 |
| 45088.0 | 6.59 |
| 45088.010416666664 | 6.58 |
| 45088.020833333336 | 6.57 |
| 45088.03125 | 6.5 |
| 45088.041666666664 | 6.48 |
| 45088.052083333336 | 6.46 |
| 45088.0625 | 6.32 |
| 45088.072916666664 | 6.24 |
| 45088.083333333336 | 6.24 |
| 45088.09375 | 6.22 |
| 45088.104166666664 | 6.13 |
| 45088.114583333336 | 6.07 |
| 45088.125 | 6.02 |
| 45088.135416666664 | 5.94 |
| 45088.145833333336 | 5.89 |
| 45088.15625 | 5.86 |
| 45088.166666666664 | 5.83 |
| 45088.177083333336 | 5.78 |
| 45088.1875 | 5.76 |
| 45088.197916666664 | 5.74 |
| 45088.208333333336 | 5.72 |
| 45088.21875 | 5.7 |
| 45088.229166666664 | 5.68 |
| 45088.239583333336 | 5.65 |
| 45088.25 | 5.64 |
| 45088.260416666664 | 5.64 |
| 45088.270833333336 | 5.63 |
| 45088.28125 | 5.63 |
| 45088.291666666664 | 5.61 |
| 45088.302083333336 | 5.58 |
| 45088.3125 | 5.49 |
| 45088.322916666664 | 5.51 |
| 45088.333333333336 | 5.52 |
| 45088.34375 | 5.49 |
| 45088.354166666664 | 5.41 |
| 45088.364583333336 | 5.31 |
| 45088.375 | 5.15 |
| 45088.385416666664 | 5.05 |
| 45088.395833333336 | 4.96 |
| 45088.40625 | 4.97 |
| 45088.416666666664 | 4.83 |
| 45088.427083333336 | 4.88 |
| 45088.4375 | 4.59 |
| 45088.447916666664 | 4.88 |
| 45088.458333333336 | 4.69 |
| 45088.46875 | 4.88 |
| 45088.479166666664 | 4.94 |
| 45088.489583333336 | 4.88 |
| 45088.5 | 4.87 |
| 45088.510416666664 | 4.86 |
| 45088.520833333336 | 4.87 |
| 45088.53125 | 4.9 |
| 45088.541666666664 | 4.91 |
| 45088.552083333336 | 4.94 |
| 45088.5625 | 4.88 |
| 45088.572916666664 | 4.96 |
| 45088.583333333336 | 4.82 |
| 45088.59375 | 4.8 |
| 45088.604166666664 | 4.77 |
| 45088.614583333336 | 4.76 |
| 45088.625 | 4.79 |
| 45088.635416666664 | 4.99 |
| 45088.645833333336 | 5.13 |
| 45088.65625 | 5.25 |
| 45088.666666666664 | 5.32 |
| 45088.677083333336 | 5.33 |
| 45088.6875 | 5.38 |
| 45088.697916666664 | 5.44 |
| 45088.708333333336 | 5.58 |
| 45088.71875 | 5.63 |
| 45088.729166666664 | 5.76 |
| 45088.739583333336 | 5.86 |
| 45088.75 | 5.95 |
| 45088.760416666664 | 6.08 |
| 45088.770833333336 | 6.17 |
| 45088.78125 | 6.24 |
| 45088.791666666664 | 6.27 |
| 45088.802083333336 | 6.32 |
| 45088.8125 | 6.31 |
| 45088.822916666664 | 6.29 |
| 45088.833333333336 | 6.26 |
| 45088.84375 | 6.28 |
| 45088.854166666664 | 6.27 |
| 45088.864583333336 | 6.26 |
| 45088.875 | 6.34 |
| 45088.885416666664 | 6.46 |
| 45088.895833333336 | 6.84 |
| 45088.90625 | 6.88 |
| 45088.916666666664 | 6.97 |
| 45088.927083333336 | 7.08 |
| 45088.9375 | 7.08 |
| 45088.947916666664 | 7.01 |
| 45088.958333333336 | 6.95 |
| 45088.96875 | 6.79 |
| 45088.979166666664 | 6.71 |
| 45088.989583333336 | 6.61 |
| 45089.0 | 6.57 |
| 45089.010416666664 | 6.55 |
| 45089.020833333336 | 6.54 |
| 45089.03125 | 6.47 |
| 45089.041666666664 | 6.4 |
| 45089.052083333336 | 6.31 |
| 45089.0625 | 6.23 |
| 45089.072916666664 | 6.18 |
| 45089.083333333336 | 6.12 |
| 45089.09375 | 6.09 |
| 45089.104166666664 | 6.05 |
| 45089.114583333336 | 6 |
| 45089.125 | 5.96 |
| 45089.135416666664 | 5.92 |
| 45089.145833333336 | 5.88 |
| 45089.15625 | 5.9 |
| 45089.166666666664 | 5.96 |
| 45089.177083333336 | 5.96 |
| 45089.1875 | 5.95 |
| 45089.197916666664 | 5.99 |
| 45089.208333333336 | 5.99 |
| 45089.21875 | 5.99 |
| 45089.229166666664 | 6.05 |
| 45089.239583333336 | 6.07 |
| 45089.25 | 6.07 |
| 45089.260416666664 | 6.07 |
| 45089.270833333336 | 6.04 |
| 45089.28125 | 6.04 |
| 45089.291666666664 | 6.06 |
| 45089.302083333336 | 6.04 |
| 45089.3125 | 6.03 |
| 45089.322916666664 | 5.99 |
| 45089.333333333336 | 5.99 |
| 45089.34375 | 5.99 |
| 45089.354166666664 | 5.91 |
| 45089.364583333336 | 5.89 |
| 45089.375 | 5.75 |
| 45089.385416666664 | 5.76 |
| 45089.395833333336 | 5.76 |
| 45089.40625 | 5.7 |
| 45089.416666666664 | 5.7 |
| 45089.427083333336 | 5.7 |
| 45089.4375 | 5.52 |
| 45089.447916666664 | 5.43 |
| 45089.458333333336 | 5.27 |
| 45089.46875 | 5.12 |
| 45089.479166666664 | 4.89 |
| 45089.489583333336 | 5.19 |
| 45089.5 | 5.06 |
| 45089.510416666664 | 4.87 |
| 45089.520833333336 | 4.95 |
| 45089.53125 | 5 |
| 45089.541666666664 | 4.99 |
| 45089.552083333336 | 4.96 |
| 45089.5625 | 5 |
| 45089.572916666664 | 4.99 |
| 45089.583333333336 | 4.96 |
| 45089.59375 | 5.01 |
| 45089.604166666664 | 5.01 |
| 45089.614583333336 | 5.05 |
| 45089.625 | 4.99 |
| 45089.635416666664 | 4.94 |
| 45089.645833333336 | 4.96 |
| 45089.65625 | 5.01 |
| 45089.666666666664 | 5.24 |
| 45089.677083333336 | 5.4 |
| 45089.6875 | 5.49 |
| 45089.697916666664 | 5.57 |
| 45089.708333333336 | 5.65 |
| 45089.71875 | 5.71 |
| 45089.729166666664 | 5.75 |
| 45089.739583333336 | 5.86 |
| 45089.75 | 5.92 |
| 45089.760416666664 | 6.05 |
| 45089.770833333336 | 6.18 |
| 45089.78125 | 6.21 |
| 45089.791666666664 | 6.28 |
| 45089.802083333336 | 6.31 |
| 45089.8125 | 6.36 |
| 45089.822916666664 | 6.35 |
| 45089.833333333336 | 6.37 |
| 45089.84375 | 6.35 |
| 45089.854166666664 | 6.31 |
| 45089.864583333336 | 6.35 |
| 45089.875 | 6.32 |
| 45089.885416666664 | 6.37 |
| 45089.895833333336 | 6.39 |
| 45089.90625 | 6.44 |
| 45089.916666666664 | 6.38 |
| 45089.927083333336 | 6.52 |
| 45089.9375 | 6.73 |
| 45089.947916666664 | 6.75 |
| 45089.958333333336 | 6.75 |
| 45089.96875 | 6.73 |
| 45089.979166666664 | 6.73 |
| 45089.989583333336 | 6.64 |
| 45090.0 | 6.49 |
| 45090.010416666664 | 6.38 |
| 45090.020833333336 | 6.22 |
| 45090.03125 | 6.12 |
| 45090.041666666664 | 6.06 |
| 45090.052083333336 | 6.04 |
| 45090.0625 | 5.93 |
| 45090.072916666664 | 5.87 |
| 45090.083333333336 | 5.79 |
| 45090.09375 | 5.7 |
| 45090.104166666664 | 5.62 |
| 45090.114583333336 | 5.54 |
| 45090.125 | 5.41 |
| 45090.135416666664 | 5.38 |
| 45090.145833333336 | 5.28 |
| 45090.15625 | 5.11 |
| 45090.166666666664 | 5.2 |
| 45090.177083333336 | 5.18 |
| 45090.1875 | 5.14 |
| 45090.197916666664 | 5.09 |
| 45090.208333333336 | 5.11 |
| 45090.21875 | 5.11 |
| 45090.229166666664 | 5.22 |
| 45090.239583333336 | 5.27 |
| 45090.25 | 5.3 |
| 45090.260416666664 | 5.29 |
| 45090.270833333336 | 5.3 |
| 45090.28125 | 5.3 |
| 45090.291666666664 | 5.32 |
| 45090.302083333336 | 5.34 |
| 45090.3125 | 5.34 |
| 45090.322916666664 | 5.36 |
| 45090.333333333336 | 5.37 |
| 45090.34375 | 5.36 |
| 45090.354166666664 | 5.38 |
| 45090.364583333336 | 5.37 |
| 45090.375 | 5.38 |
| 45090.385416666664 | 5.33 |
| 45090.395833333336 | 5.1 |
| 45090.40625 | 5.21 |
| 45090.416666666664 | 5.18 |
| 45090.427083333336 | 5.25 |
| 45090.4375 | 5.16 |
| 45090.447916666664 | 4.97 |
| 45090.458333333336 | 4.96 |
| 45090.46875 | 4.77 |
| 45090.479166666664 | 4.71 |
| 45090.489583333336 | 4.63 |
| 45090.5 | 4.63 |
| 45090.510416666664 | 4.58 |
| 45090.520833333336 | 4.53 |
| 45090.53125 | 4.55 |
| 45090.541666666664 | 4.91 |
| 45090.552083333336 | 4.72 |
| 45090.5625 | 4.85 |
| 45090.572916666664 | 4.88 |
| 45090.583333333336 | 5.04 |
| 45090.59375 | 5.14 |
| 45090.604166666664 | 5.21 |
| 45090.614583333336 | 5.21 |
| 45090.625 | 5.28 |
| 45090.635416666664 | 5.51 |
| 45090.645833333336 | 5.26 |
| 45090.65625 | 5.37 |
| 45090.666666666664 | 5.23 |
| 45090.677083333336 | 5.14 |
| 45090.6875 | 5.03 |
| 45090.697916666664 | 5.07 |
| 45090.708333333336 | 5.21 |
| 45090.71875 | 5.42 |
| 45090.729166666664 | 5.47 |
| 45090.739583333336 | 5.52 |
| 45090.75 | 5.48 |
| 45090.760416666664 | 5.47 |
| 45090.770833333336 | 5.49 |
| 45090.78125 | 5.54 |
| 45090.791666666664 | 5.61 |
| 45090.802083333336 | 5.73 |
| 45090.8125 | 5.85 |
| 45090.822916666664 | 5.92 |
| 45090.833333333336 | 6.03 |
| 45090.84375 | 6.06 |
| 45090.854166666664 | 6.15 |
| 45090.864583333336 | 6.22 |
| 45090.875 | 6.25 |
| 45090.885416666664 | 6.21 |
| 45090.895833333336 | 6.19 |
| 45090.90625 | 6.22 |
| 45090.916666666664 | 6.16 |
| 45090.927083333336 | 6.11 |
| 45090.9375 | 6.14 |
| 45090.947916666664 | 6.19 |
| 45090.958333333336 | 6.2 |
| 45090.96875 | 6.24 |
| 45090.979166666664 | 6.53 |
| 45090.989583333336 | 6.47 |
| 45091.0 | 6.48 |
| 45091.010416666664 | 6.43 |
| 45091.020833333336 | 6.35 |
| 45091.03125 | 6.27 |
| 45091.041666666664 | 6.08 |
| 45091.052083333336 | 5.96 |
| 45091.0625 | 5.9 |
| 45091.072916666664 | 5.81 |
| 45091.083333333336 | 5.8 |
| 45091.09375 | 5.77 |
| 45091.104166666664 | 5.71 |
| 45091.114583333336 | 5.7 |
| 45091.125 | 5.62 |
| 45091.135416666664 | 5.54 |
| 45091.145833333336 | 5.48 |
| 45091.15625 | 5.45 |
| 45091.166666666664 | 5.4 |
| 45091.177083333336 | 5.38 |
| 45091.1875 | 5.37 |
| 45091.197916666664 | 5.21 |
| 45091.208333333336 | 5.23 |
| 45091.21875 | 5.21 |
| 45091.229166666664 | 5.18 |
| 45091.239583333336 | 5.17 |
| 45091.25 | 5.21 |
| 45091.260416666664 | 5.22 |
| 45091.270833333336 | 5.25 |
| 45091.28125 | 5.24 |
| 45091.291666666664 | 5.24 |
| 45091.302083333336 | 5.24 |
| 45091.3125 | 5.25 |
| 45091.322916666664 | 5.26 |
| 45091.333333333336 | 5.27 |
| 45091.34375 | 5.28 |
| 45091.354166666664 | 5.3 |
| 45091.364583333336 | 5.31 |
| 45091.375 | 5.33 |
| 45091.385416666664 | 5.34 |
| 45091.395833333336 | 5.36 |
| 45091.40625 | 5.34 |
| 45091.416666666664 | 5.3 |
| 45091.427083333336 | 5.34 |
| 45091.4375 | 5.31 |
| 45091.447916666664 | 5.14 |
| 45091.458333333336 | 5.18 |
| 45091.46875 | 5.27 |
| 45091.479166666664 | 5.23 |
| 45091.489583333336 | 5.14 |
| 45091.5 | 5.06 |
| 45091.510416666664 | 5.01 |
| 45091.520833333336 | 5.03 |
| 45091.53125 | 5.07 |
| 45091.541666666664 | 5.04 |
| 45091.552083333336 | 5.1 |
| 45091.5625 | 5.23 |
| 45091.572916666664 | 5.32 |
| 45091.583333333336 | 5.31 |
| 45091.59375 | 5.45 |
| 45091.604166666664 | 5.59 |
| 45091.614583333336 | 5.52 |
| 45091.625 | 5.56 |
| 45091.635416666664 | 5.6 |
| 45091.645833333336 | 5.62 |
| 45091.65625 | 5.65 |
| 45091.666666666664 | 5.71 |
| 45091.677083333336 | 5.77 |
| 45091.6875 | 5.64 |
| 45091.697916666664 | 5.6 |
| 45091.708333333336 | 5.49 |
| 45091.71875 | 5.41 |
| 45091.729166666664 | 5.48 |
| 45091.739583333336 | 5.65 |
| 45091.75 | 5.7 |
| 45091.760416666664 | 5.72 |
| 45091.770833333336 | 5.75 |
| 45091.78125 | 5.8 |
| 45091.791666666664 | 5.86 |
| 45091.802083333336 | 5.87 |
| 45091.8125 | 5.92 |
| 45091.822916666664 | 5.96 |
| 45091.833333333336 | 5.99 |
| 45091.84375 | 6.04 |
| 45091.854166666664 | 6.09 |
| 45091.864583333336 | 6.09 |
| 45091.875 | 6.14 |
| 45091.885416666664 | 6.14 |
| 45091.895833333336 | 6.12 |
| 45091.90625 | 6.11 |
| 45091.916666666664 | 6.09 |
| 45091.927083333336 | 6.08 |
| 45091.9375 | 6.08 |
| 45091.947916666664 | 6.06 |
| 45091.958333333336 | 6.06 |
| 45091.96875 | 6.01 |
| 45091.979166666664 | 5.97 |
| 45091.989583333336 | 5.77 |
| 45092.0 | 5.95 |
| 45092.010416666664 | 5.92 |
| 45092.020833333336 | 5.87 |
| 45092.03125 | 5.87 |
| 45092.041666666664 | 5.88 |
| 45092.052083333336 | 5.72 |
| 45092.0625 | 5.73 |
| 45092.072916666664 | 5.59 |
| 45092.083333333336 | 5.45 |
| 45092.09375 | 5.3 |
| 45092.104166666664 | 5.1 |
| 45092.114583333336 | 4.99 |
| 45092.125 | 5.02 |
| 45092.135416666664 | 5.22 |
| 45092.145833333336 | 5.15 |
| 45092.15625 | 5.13 |
| 45092.166666666664 | 5.13 |
| 45092.177083333336 | 5.11 |
| 45092.1875 | 5.07 |
| 45092.197916666664 | 5 |
| 45092.208333333336 | 5.04 |
| 45092.21875 | 4.85 |
| 45092.229166666664 | 4.92 |
| 45092.239583333336 | 4.88 |
| 45092.25 | 4.87 |
| 45092.260416666664 | 4.86 |
| 45092.270833333336 | 4.88 |
| 45092.28125 | 4.83 |
| 45092.291666666664 | 4.84 |
| 45092.302083333336 | 4.88 |
| 45092.3125 | 4.93 |
| 45092.322916666664 | 4.9 |
| 45092.333333333336 | 4.89 |
| 45092.34375 | 4.86 |
| 45092.354166666664 | 4.85 |
| 45092.364583333336 | 4.85 |
| 45092.375 | 4.81 |
| 45092.385416666664 | 4.78 |
| 45092.395833333336 | 4.78 |
| 45092.40625 | 4.79 |
| 45092.416666666664 | 4.78 |
| 45092.427083333336 | 4.8 |
| 45092.4375 | 4.85 |
| 45092.447916666664 | 4.85 |
| 45092.458333333336 | 4.86 |
| 45092.46875 | 4.87 |
| 45092.479166666664 | 4.89 |
| 45092.489583333336 | 4.81 |
| 45092.5 | 4.86 |
| 45092.510416666664 | 4.91 |
| 45092.520833333336 | 4.87 |
| 45092.53125 | 4.72 |
| 45092.541666666664 | 4.69 |
| 45092.552083333336 | 4.7 |
| 45092.5625 | 4.77 |
| 45092.572916666664 | 4.81 |
| 45092.583333333336 | 4.93 |
| 45092.59375 | 4.97 |
| 45092.604166666664 | 5.04 |
| 45092.614583333336 | 5.14 |
| 45092.625 | 5.17 |
| 45092.635416666664 | 5.21 |
| 45092.645833333336 | 5.27 |
| 45092.65625 | 5.41 |
| 45092.666666666664 | 5.55 |
| 45092.677083333336 | 5.56 |
| 45092.6875 | 5.61 |
| 45092.697916666664 | 5.62 |
| 45092.708333333336 | 5.61 |
| 45092.71875 | 5.79 |
| 45092.729166666664 | 5.73 |
| 45092.739583333336 | 5.49 |
| 45092.75 | 5.39 |
| 45092.760416666664 | 5.33 |
| 45092.770833333336 | 5.32 |
| 45092.78125 | 5.33 |
| 45092.791666666664 | 5.36 |
| 45092.802083333336 | 5.44 |
| 45092.8125 | 5.48 |
| 45092.822916666664 | 5.45 |
| 45092.833333333336 | 5.43 |
| 45092.84375 | 5.43 |
| 45092.854166666664 | 5.45 |
| 45092.864583333336 | 5.49 |
| 45092.875 | 5.5 |
| 45092.885416666664 | 5.56 |
| 45092.895833333336 | 5.67 |
| 45092.90625 | 5.85 |
| 45092.916666666664 | 5.99 |
| 45092.927083333336 | 6.11 |
| 45092.9375 | 6.13 |
| 45092.947916666664 | 6.11 |
| 45092.958333333336 | 6.08 |
| 45092.96875 | 6.04 |
| 45092.979166666664 | 6.02 |
| 45092.989583333336 | 5.98 |
| 45093.0 | 5.97 |
| 45093.010416666664 | 5.77 |
| 45093.020833333336 | 5.71 |
| 45093.03125 | 5.75 |
| 45093.041666666664 | 5.7 |
| 45093.052083333336 | 5.86 |
| 45093.0625 | 5.77 |
| 45093.072916666664 | 5.59 |
| 45093.083333333336 | 5.43 |
| 45093.09375 | 5.29 |
| 45093.104166666664 | 5.12 |
| 45093.114583333336 | 5.04 |
| 45093.125 | 4.96 |
| 45093.135416666664 | 4.75 |
| 45093.145833333336 | 4.59 |
| 45093.15625 | 4.86 |
| 45093.166666666664 | 4.8 |
| 45093.177083333336 | 4.82 |
| 45093.1875 | 4.8 |
| 45093.197916666664 | 4.8 |
| 45093.208333333336 | 4.81 |
| 45093.21875 | 4.76 |
| 45093.229166666664 | 4.75 |
| 45093.239583333336 | 4.69 |
| 45093.25 | 4.64 |
| 45093.260416666664 | 4.58 |
| 45093.270833333336 | 4.51 |
| 45093.28125 | 4.48 |
| 45093.291666666664 | 4.49 |
| 45093.302083333336 | 4.49 |
| 45093.3125 | 4.48 |
| 45093.322916666664 | 4.48 |
| 45093.333333333336 | 4.51 |
| 45093.34375 | 4.54 |
| 45093.354166666664 | 4.57 |
| 45093.364583333336 | 4.55 |
| 45093.375 | 4.56 |
| 45093.385416666664 | 4.58 |
| 45093.395833333336 | 4.57 |
| 45093.40625 | 4.57 |
| 45093.416666666664 | 4.56 |
| 45093.427083333336 | 4.55 |
| 45093.4375 | 4.58 |
| 45093.447916666664 | 4.6 |
| 45093.458333333336 | 4.64 |
| 45093.46875 | 4.72 |
| 45093.479166666664 | 4.76 |
| 45093.489583333336 | 4.82 |
| 45093.5 | 4.84 |
| 45093.510416666664 | 4.93 |
| 45093.520833333336 | 4.86 |
| 45093.53125 | 4.64 |
| 45093.541666666664 | 4.72 |
| 45093.552083333336 | 4.91 |
| 45093.5625 | 5.06 |
| 45093.572916666664 | 5.17 |
| 45093.583333333336 | 5.24 |
| 45093.59375 | 5.29 |
| 45093.604166666664 | 5.28 |
| 45093.614583333336 | 5.41 |
| 45093.625 | 5.4 |
| 45093.635416666664 | 5.53 |
| 45093.645833333336 | 5.6 |
| 45093.65625 | 5.62 |
| 45093.666666666664 | 5.75 |
| 45093.677083333336 | 5.83 |
| 45093.6875 | 5.95 |
| 45093.697916666664 | 6.01 |
| 45093.708333333336 | 6.03 |
| 45093.71875 | 5.96 |
| 45093.729166666664 | 5.93 |
| 45093.739583333336 | 7.9 |
| 45093.75 | 5.9 |
| 45093.760416666664 | 5.91 |
| 45093.770833333336 | 5.84 |
| 45093.78125 | 5.76 |
| 45093.791666666664 | 5.64 |
| 45093.802083333336 | 5.63 |
| 45093.8125 | 5.63 |
| 45093.822916666664 | 5.61 |
| 45093.833333333336 | 5.6 |
| 45093.84375 | 5.57 |
| 45093.854166666664 | 5.58 |
| 45093.864583333336 | 5.58 |
| 45093.875 | 5.6 |
| 45093.885416666664 | 5.64 |
| 45093.895833333336 | 5.64 |
| 45093.90625 | 5.7 |
| 45093.916666666664 | 5.7 |
| 45093.927083333336 | 5.67 |
| 45093.9375 | 5.67 |
| 45093.947916666664 | 5.67 |
| 45093.958333333336 | 5.66 |
| 45093.96875 | 5.66 |
| 45093.979166666664 | 5.64 |
| 45093.989583333336 | 5.62 |
| 45094.0 | 5.61 |
| 45094.010416666664 | 5.53 |
| 45094.020833333336 | 5.52 |
| 45094.03125 | 5.5 |
| 45094.041666666664 | 5.47 |
| 45094.052083333336 | 5.4 |
| 45094.0625 | 5.41 |
| 45094.072916666664 | 5.37 |
| 45094.083333333336 | 5.25 |
| 45094.09375 | 5.16 |
| 45094.104166666664 | 5.13 |
| 45094.114583333336 | 5.06 |
| 45094.125 | 5.01 |
| 45094.135416666664 | 4.92 |
| 45094.145833333336 | 4.78 |
| 45094.15625 | 4.55 |
| 45094.166666666664 | 4.49 |
| 45094.177083333336 | 4.39 |
| 45094.1875 | 4.15 |
| 45094.197916666664 | 4.34 |
| 45094.208333333336 | 4.19 |
| 45094.21875 | 4.28 |
| 45094.229166666664 | 4.34 |
| 45094.239583333336 | 4.51 |
| 45094.25 | 4.47 |
| 45094.260416666664 | 4.37 |
| 45094.270833333336 | 4.31 |
| 45094.28125 | 4.34 |
| 45094.291666666664 | 4.33 |
| 45094.302083333336 | 4.29 |
| 45094.3125 | 4.22 |
| 45094.322916666664 | 4.23 |
| 45094.333333333336 | 4.18 |
| 45094.34375 | 4.18 |
| 45094.354166666664 | 4.19 |
| 45094.364583333336 | 4.2 |
| 45094.375 | 4.24 |
| 45094.385416666664 | 4.36 |
| 45094.395833333336 | 4.52 |
| 45094.40625 | 4.58 |
| 45094.416666666664 | 4.57 |
| 45094.427083333336 | 4.6 |
| 45094.4375 | 4.62 |
| 45094.447916666664 | 4.62 |
| 45094.458333333336 | 4.61 |
| 45094.46875 | 4.63 |
| 45094.479166666664 | 4.63 |
| 45094.489583333336 | 4.66 |
| 45094.5 | 4.66 |
| 45094.510416666664 | 4.65 |
| 45094.520833333336 | 4.65 |
| 45094.53125 | 4.75 |
| 45094.541666666664 | 4.89 |
| 45094.552083333336 | 4.91 |
| 45094.5625 | 4.99 |
| 45094.572916666664 | 4.97 |
| 45094.583333333336 | 4.97 |
| 45094.59375 | 5.02 |
| 45094.604166666664 | 5.06 |
| 45094.614583333336 | 5.13 |
| 45094.625 | 5.19 |
| 45094.635416666664 | 5.25 |
| 45094.645833333336 | 5.31 |
| 45094.65625 | 5.49 |
| 45094.666666666664 | 5.53 |
| 45094.677083333336 | 5.51 |
| 45094.6875 | 5.74 |
| 45094.697916666664 | 5.78 |
| 45094.708333333336 | 5.85 |
| 45094.71875 | 5.93 |
| 45094.729166666664 | 6.03 |
| 45094.739583333336 | 6.08 |
| 45094.75 | 6.13 |
| 45094.760416666664 | 6.09 |
| 45094.770833333336 | 6.23 |
| 45094.78125 | 6.28 |
| 45094.791666666664 | 6.34 |
| 45094.802083333336 | 6.13 |
| 45094.8125 | 6.03 |
| 45094.822916666664 | 5.92 |
| 45094.833333333336 | 5.93 |
| 45094.84375 | 5.87 |
| 45094.854166666664 | 5.97 |
| 45094.864583333336 | 6.02 |
| 45094.875 | 5.99 |
| 45094.885416666664 | 5.98 |
| 45094.895833333336 | 5.96 |
| 45094.90625 | 5.96 |
| 45094.916666666664 | 5.94 |
| 45094.927083333336 | 5.93 |
| 45094.9375 | 5.94 |
| 45094.947916666664 | 5.96 |
| 45094.958333333336 | 6.08 |
| 45094.96875 | 6.17 |
| 45094.979166666664 | 6.21 |
| 45094.989583333336 | 6.24 |
| 45095.0 | 6.29 |
| 45095.010416666664 | 6.27 |
| 45095.020833333336 | 6.22 |
| 45095.03125 | 6.2 |
| 45095.041666666664 | 6.17 |
| 45095.052083333336 | 6.14 |
| 45095.0625 | 6.1 |
| 45095.072916666664 | 6.04 |
| 45095.083333333336 | 5.95 |
| 45095.09375 | 5.95 |
| 45095.104166666664 | 5.94 |
| 45095.114583333336 | 5.81 |
| 45095.125 | 5.67 |
| 45095.135416666664 | 5.49 |
| 45095.145833333336 | 5.42 |
| 45095.15625 | 5.12 |
| 45095.166666666664 | 4.87 |
| 45095.177083333336 | 4.69 |
| 45095.1875 | 4.56 |
| 45095.197916666664 | 4.36 |
| 45095.208333333336 | 4.39 |
| 45095.21875 | 4.2 |
| 45095.229166666664 | 4.27 |
| 45095.239583333336 | 4.38 |
| 45095.25 | 4.47 |
| 45095.260416666664 | 4.58 |
| 45095.270833333336 | 4.74 |
| 45095.28125 | 4.75 |
| 45095.291666666664 | 4.76 |
| 45095.302083333336 | 4.74 |
| 45095.3125 | 4.75 |
| 45095.322916666664 | 4.71 |
| 45095.333333333336 | 4.63 |
| 45095.34375 | 4.57 |
| 45095.354166666664 | 4.54 |
| 45095.364583333336 | 4.53 |
| 45095.375 | 4.54 |
| 45095.385416666664 | 4.5 |
| 45095.395833333336 | 4.51 |
| 45095.40625 | 4.56 |
| 45095.416666666664 | 4.65 |
| 45095.427083333336 | 4.73 |
| 45095.4375 | 4.71 |
| 45095.447916666664 | 4.69 |
| 45095.458333333336 | 4.67 |
| 45095.46875 | 4.69 |
| 45095.479166666664 | 4.7 |
| 45095.489583333336 | 4.71 |
| 45095.5 | 4.71 |
| 45095.510416666664 | 4.71 |
| 45095.520833333336 | 4.7 |
| 45095.53125 | 4.73 |
| 45095.541666666664 | 4.77 |
| 45095.552083333336 | 4.79 |
| 45095.5625 | 4.8 |
| 45095.572916666664 | 4.81 |
| 45095.583333333336 | 4.91 |
| 45095.59375 | 4.84 |
| 45095.604166666664 | 4.94 |
| 45095.614583333336 | 5.19 |
| 45095.625 | 5.23 |
| 45095.635416666664 | 5.54 |
| 45095.645833333336 | 5.83 |
| 45095.65625 | 6.03 |
| 45095.666666666664 | 5.97 |
| 45095.677083333336 | 6.22 |
| 45095.6875 | 5.94 |
| 45095.697916666664 | 5.9 |
| 45095.708333333336 | 6.06 |
| 45095.71875 | 6.23 |
| 45095.729166666664 | 6.38 |
| 45095.739583333336 | 6.51 |
| 45095.75 | 6.62 |
| 45095.760416666664 | 6.64 |
| 45095.770833333336 | 6.65 |
| 45095.78125 | 6.63 |
| 45095.791666666664 | 6.68 |
| 45095.802083333336 | 6.67 |
| 45095.8125 | 6.71 |
| 45095.822916666664 | 6.65 |
| 45095.833333333336 | 6.51 |
| 45095.84375 | 6.39 |
| 45095.854166666664 | 6.36 |
| 45095.864583333336 | 6.24 |
| 45095.875 | 6.24 |
| 45095.885416666664 | 6.24 |
| 45095.895833333336 | 6.21 |
| 45095.90625 | 6.1 |
| 45095.916666666664 | 6.03 |
| 45095.927083333336 | 6.05 |
| 45095.9375 | 5.99 |
| 45095.947916666664 | 5.95 |
| 45095.958333333336 | 5.95 |
| 45095.96875 | 5.97 |
| 45095.979166666664 | 5.95 |
| 45095.989583333336 | 5.98 |
| 45096.0 | 5.97 |
| 45096.010416666664 | 6.02 |
| 45096.020833333336 | 6.07 |
| 45096.03125 | 6.12 |
| 45096.041666666664 | 6.18 |
| 45096.052083333336 | 6.16 |
| 45096.0625 | 6.08 |
| 45096.072916666664 | 6.07 |
| 45096.083333333336 | 6.02 |
| 45096.09375 | 5.98 |
| 45096.104166666664 | 5.84 |
| 45096.114583333336 | 5.86 |
| 45096.125 | 5.78 |
| 45096.135416666664 | 5.71 |
| 45096.145833333336 | 5.66 |
| 45096.15625 | 5.58 |
| 45096.166666666664 | 5.45 |
| 45096.177083333336 | 5.26 |
| 45096.1875 | 5.19 |
| 45096.197916666664 | 5.1 |
| 45096.208333333336 | 4.78 |
| 45096.21875 | 4.67 |
| 45096.229166666664 | 5.15 |
| 45096.239583333336 | 5.05 |
| 45096.25 | 4.77 |
| 45096.260416666664 | 4.85 |
| 45096.270833333336 | 4.84 |
| 45096.28125 | 4.79 |
| 45096.291666666664 | 4.82 |
| 45096.302083333336 | 4.84 |
| 45096.3125 | 4.75 |
| 45096.322916666664 | 4.74 |
| 45096.333333333336 | 4.69 |
| 45096.34375 | 4.65 |
| 45096.354166666664 | 4.53 |
| 45096.364583333336 | 4.52 |
| 45096.375 | 4.49 |
| 45096.385416666664 | 4.47 |
| 45096.395833333336 | 4.48 |
| 45096.40625 | 4.44 |
| 45096.416666666664 | 4.43 |
| 45096.427083333336 | 4.49 |
| 45096.4375 | 4.61 |
| 45096.447916666664 | 4.64 |
| 45096.458333333336 | 4.66 |
| 45096.46875 | 4.66 |
| 45096.479166666664 | 4.64 |
| 45096.489583333336 | 4.64 |
| 45096.5 | 4.63 |
| 45096.510416666664 | 4.66 |
| 45096.520833333336 | 4.66 |
| 45096.53125 | 4.68 |
| 45096.541666666664 | 4.69 |
| 45096.552083333336 | 4.79 |
| 45096.5625 | 4.85 |
| 45096.572916666664 | 4.94 |
| 45096.583333333336 | 5 |
| 45096.59375 | 5.05 |
| 45096.604166666664 | 5.04 |
| 45096.614583333336 | 5.09 |
| 45096.625 | 4.84 |
| 45096.635416666664 | 5.32 |
| 45096.645833333336 | 5.66 |
| 45096.65625 | 5.83 |
| 45096.666666666664 | 6.12 |
| 45096.677083333336 | 6.3 |
| 45096.6875 | 6.39 |
| 45096.697916666664 | 6.61 |
| 45096.708333333336 | 6.47 |
| 45096.71875 | 6.38 |
| 45096.729166666664 | 6.45 |
| 45096.739583333336 | 6.49 |
| 45096.75 | 6.65 |
| 45096.760416666664 | 6.83 |
| 45096.770833333336 | 6.9 |
| 45096.78125 | 6.94 |
| 45096.791666666664 | 7 |
| 45096.802083333336 | 6.97 |
| 45096.8125 | 6.9 |
| 45096.822916666664 | 6.94 |
| 45096.833333333336 | 6.92 |
| 45096.84375 | 6.93 |
| 45096.854166666664 | 6.84 |
| 45096.864583333336 | 6.8 |
| 45096.875 | 6.73 |
| 45096.885416666664 | 6.64 |
| 45096.895833333336 | 6.54 |
| 45096.90625 | 6.62 |
| 45096.916666666664 | 6.55 |
| 45096.927083333336 | 6.42 |
| 45096.9375 | 6.39 |
| 45096.947916666664 | 6.4 |
| 45096.958333333336 | 6.41 |
| 45096.96875 | 6.45 |
| 45096.979166666664 | 6.54 |
| 45096.989583333336 | 6.57 |
| 45097.0 | 6.53 |
| 45097.010416666664 | 6.48 |
| 45097.020833333336 | 6.5 |
| 45097.03125 | 6.47 |
| 45097.041666666664 | 6.5 |
| 45097.052083333336 | 6.41 |
| 45097.0625 | 6.38 |
| 45097.072916666664 | 6.37 |
| 45097.083333333336 | 6.33 |
| 45097.09375 | 6.26 |
| 45097.104166666664 | 6.22 |
| 45097.114583333336 | 6.16 |
| 45097.125 | 6.07 |
| 45097.135416666664 | 5.99 |
| 45097.145833333336 | 5.97 |
| 45097.15625 | 5.94 |
| 45097.166666666664 | 5.81 |
| 45097.177083333336 | 5.63 |
| 45097.1875 | 5.61 |
| 45097.197916666664 | 5.45 |
| 45097.208333333336 | 5.2 |
| 45097.21875 | 5.27 |
| 45097.229166666664 | 5.06 |
| 45097.239583333336 | 5.03 |
| 45097.25 | 4.75 |
| 45097.260416666664 | 4.95 |
| 45097.270833333336 | 5.03 |
| 45097.28125 | 4.92 |
| 45097.291666666664 | 4.82 |
| 45097.302083333336 | 4.8 |
| 45097.3125 | 4.77 |
| 45097.322916666664 | 4.8 |
| 45097.333333333336 | 4.78 |
| 45097.34375 | 4.73 |
| 45097.354166666664 | 4.66 |
| 45097.364583333336 | 4.61 |
| 45097.375 | 4.55 |
| 45097.385416666664 | 4.53 |
| 45097.395833333336 | 4.47 |
| 45097.40625 | 4.41 |
| 45097.416666666664 | 4.34 |
| 45097.427083333336 | 4.34 |
| 45097.4375 | 4.37 |
| 45097.447916666664 | 4.36 |
| 45097.458333333336 | 4.37 |
| 45097.46875 | 4.42 |
| 45097.479166666664 | 4.52 |
| 45097.489583333336 | 4.52 |
| 45097.5 | 4.59 |
| 45097.510416666664 | 4.64 |
| 45097.520833333336 | 4.64 |
| 45097.53125 | 4.71 |
| 45097.541666666664 | 4.71 |
| 45097.552083333336 | 4.78 |
| 45097.5625 | 4.8 |
| 45097.572916666664 | 4.83 |
| 45097.583333333336 | 4.97 |
| 45097.59375 | 5.09 |
| 45097.604166666664 | 5.06 |
| 45097.614583333336 | 5.16 |
| 45097.625 | 5.03 |
| 45097.635416666664 | 5.04 |
| 45097.645833333336 | 5.44 |
| 45097.65625 | 5.4 |
| 45097.666666666664 | 5.54 |
| 45097.677083333336 | 5.53 |
| 45097.6875 | 5.55 |
| 45097.697916666664 | 5.5 |
| 45097.708333333336 | 5.38 |
| 45097.71875 | 5.61 |
| 45097.729166666664 | 5.57 |
| 45097.739583333336 | 5.55 |
| 45097.75 | 5.57 |
| 45097.760416666664 | 5.52 |
| 45097.770833333336 | 5.63 |
| 45097.78125 | 5.67 |
| 45097.791666666664 | 5.8 |
| 45097.802083333336 | 5.96 |
| 45097.8125 | 6.08 |
| 45097.822916666664 | 5.94 |
| 45097.833333333336 | 5.84 |
| 45097.84375 | 5.79 |
| 45097.854166666664 | 5.78 |
| 45097.864583333336 | 5.79 |
| 45097.875 | 5.76 |
| 45097.885416666664 | 5.63 |
| 45097.895833333336 | 5.57 |
| 45097.90625 | 5.63 |
| 45097.916666666664 | 5.7 |
| 45097.927083333336 | 5.72 |
| 45097.9375 | 5.69 |
| 45097.947916666664 | 5.66 |
| 45097.958333333336 | 5.81 |
| 45097.96875 | 5.92 |
| 45097.979166666664 | 6 |
| 45097.989583333336 | 6.1 |
| 45098.0 | 6.19 |
| 45098.010416666664 | 6.2 |
| 45098.020833333336 | 6.24 |
| 45098.03125 | 6.24 |
| 45098.041666666664 | 6.23 |
| 45098.052083333336 | 6.24 |
| 45098.0625 | 6.22 |
| 45098.072916666664 | 6.25 |
| 45098.083333333336 | 6.24 |
| 45098.09375 | 6.29 |
| 45098.104166666664 | 6.3 |
| 45098.114583333336 | 6.31 |
| 45098.125 | 6.24 |
| 45098.135416666664 | 6.18 |
| 45098.145833333336 | 6.17 |
| 45098.15625 | 5.91 |
| 45098.166666666664 | 5.91 |
| 45098.177083333336 | 5.98 |
| 45098.1875 | 5.97 |
| 45098.197916666664 | 6.03 |
| 45098.208333333336 | 6.03 |
| 45098.21875 | 6.01 |
| 45098.229166666664 | 5.93 |
| 45098.239583333336 | 5.95 |
| 45098.25 | 5.95 |
| 45098.260416666664 | 6.03 |
| 45098.270833333336 | 6.05 |
| 45098.28125 | 6.03 |
| 45098.291666666664 | 6.03 |
| 45098.302083333336 | 6.04 |
| 45098.3125 | 6.01 |
| 45098.322916666664 | 6.03 |
| 45098.333333333336 | 6.04 |
| 45098.34375 | 6.05 |
| 45098.354166666664 | 6.1 |
| 45098.364583333336 | 6.11 |
| 45098.375 | 6.16 |
| 45098.385416666664 | 6.24 |
| 45098.395833333336 | 6.37 |
| 45098.40625 | 6.43 |
| 45098.416666666664 | 6.26 |
| 45098.427083333336 | 6.36 |
| 45098.4375 | 6.3 |
| 45098.447916666664 | 6.5 |
| 45098.458333333336 | 6.55 |
| 45098.46875 | 6.75 |
| 45098.479166666664 | 6.75 |
| 45098.489583333336 | 6.75 |
| 45098.5 | 6.65 |
| 45098.510416666664 | 6.59 |
| 45098.520833333336 | 6.49 |
| 45098.53125 | 6.59 |
| 45098.541666666664 | 6.64 |
| 45098.552083333336 | 6.7 |
| 45098.5625 | 6.59 |
| 45098.572916666664 | 6.56 |
| 45098.583333333336 | 6.72 |
| 45098.59375 | 6.76 |
| 45098.604166666664 | 6.81 |
| 45098.614583333336 | 6.85 |
| 45098.625 | 6.85 |
| 45098.635416666664 | 6.87 |
| 45098.645833333336 | 6.87 |
| 45098.65625 | 6.88 |
| 45098.666666666664 | 6.87 |
| 45098.677083333336 | 6.86 |
| 45098.6875 | 6.86 |
| 45098.697916666664 | 6.86 |
| 45098.708333333336 | 6.85 |
| 45098.71875 | 6.84 |
| 45098.729166666664 | 6.83 |
| 45098.739583333336 | 6.84 |
| 45098.75 | 6.83 |
| 45098.760416666664 | 6.84 |
| 45098.770833333336 | 6.84 |
| 45098.78125 | 6.84 |
| 45098.791666666664 | 6.83 |
| 45098.802083333336 | 6.82 |
| 45098.8125 | 6.8 |
| 45098.822916666664 | 6.81 |
| 45098.833333333336 | 6.78 |
| 45098.84375 | 6.77 |
| 45098.864583333336 | 6.66 |
| 45098.875 | 6.7 |
| 45098.885416666664 | 6.64 |
| 45098.895833333336 | 6.7 |
| 45098.90625 | 6.7 |
| 45098.916666666664 | 6.71 |
| 45098.927083333336 | 6.76 |
| 45098.9375 | 6.71 |
| 45098.947916666664 | 6.73 |
| 45098.958333333336 | 6.54 |
| 45098.96875 | 6.52 |
| 45098.979166666664 | 6.58 |
| 45098.989583333336 | 6.59 |
| 45099.0 | 6.6 |
| 45099.010416666664 | 6.59 |
| 45099.020833333336 | 6.6 |
| 45099.03125 | 6.63 |
| 45099.041666666664 | 6.68 |
| 45099.052083333336 | 6.69 |
| 45099.0625 | 6.72 |
| 45099.072916666664 | 6.73 |
| 45099.083333333336 | 6.74 |
| 45099.09375 | 6.73 |
| 45099.104166666664 | 6.82 |
| 45099.114583333336 | 6.8 |
| 45099.125 | 6.81 |
| 45099.135416666664 | 6.75 |
| 45099.145833333336 | 6.74 |
| 45099.15625 | 6.72 |
| 45099.166666666664 | 6.65 |
| 45099.177083333336 | 6.71 |
| 45099.1875 | 6.55 |
| 45099.197916666664 | 6.58 |
| 45099.208333333336 | 6.6 |
| 45099.21875 | 6.63 |
| 45099.229166666664 | 6.53 |
| 45099.239583333336 | 6.57 |
| 45099.25 | 6.53 |
| 45099.260416666664 | 6.54 |
| 45099.270833333336 | 6.5 |
| 45099.28125 | 6.43 |
| 45099.291666666664 | 6.47 |
| 45099.302083333336 | 6.46 |
| 45099.3125 | 6.41 |
| 45099.322916666664 | 6.37 |
| 45099.333333333336 | 6.29 |
| 45099.34375 | 6.19 |
| 45099.354166666664 | 6.09 |
| 45099.364583333336 | 6.03 |
| 45099.375 | 5.9 |
| 45099.385416666664 | 5.88 |
| 45099.395833333336 | 5.82 |
| 45099.40625 | 5.8 |
| 45099.416666666664 | 5.74 |
| 45099.427083333336 | 5.82 |
| 45099.4375 | 5.86 |
| 45099.447916666664 | 5.9 |
| 45099.458333333336 | 5.87 |
| 45099.46875 | 5.84 |
| 45099.479166666664 | 5.82 |
| 45099.489583333336 | 5.89 |
| 45099.5 | 5.76 |
| 45099.510416666664 | 5.75 |
| 45099.520833333336 | 5.78 |
| 45099.53125 | 5.89 |
| 45099.541666666664 | 5.98 |
| 45099.552083333336 | 6.07 |
| 45099.5625 | 6.18 |
| 45099.572916666664 | 6.26 |
| 45099.583333333336 | 6.33 |
| 45099.59375 | 6.35 |
| 45099.604166666664 | 6.38 |
| 45099.614583333336 | 6.38 |
| 45099.625 | 6.43 |
| 45099.635416666664 | 6.46 |
| 45099.645833333336 | 6.47 |
| 45099.65625 | 6.48 |
| 45099.666666666664 | 6.49 |
| 45099.677083333336 | 6.51 |
| 45099.6875 | 6.47 |
| 45099.697916666664 | 6.67 |
| 45099.708333333336 | 6.62 |
| 45099.71875 | 6.74 |
| 45099.729166666664 | 6.7 |
| 45099.739583333336 | 6.79 |
| 45099.75 | 6.89 |
| 45099.760416666664 | 6.96 |
| 45099.770833333336 | 7.12 |
| 45099.78125 | 7.15 |
| 45099.791666666664 | 7.21 |
| 45099.802083333336 | 7.2 |
| 45099.8125 | 7.21 |
| 45099.822916666664 | 7.25 |
| 45099.833333333336 | 7.3 |
| 45099.84375 | 7.32 |
| 45099.854166666664 | 7.27 |
| 45099.864583333336 | 7.26 |
| 45099.875 | 7.17 |
| 45099.885416666664 | 7.13 |
| 45099.895833333336 | 7.13 |
| 45099.90625 | 7.15 |
| 45099.916666666664 | 7.1 |
| 45099.927083333336 | 7.07 |
| 45099.9375 | 7.02 |
| 45099.947916666664 | 7 |
| 45099.958333333336 | 6.99 |
| 45099.96875 | 6.97 |
| 45099.979166666664 | 6.84 |
| 45099.989583333336 | 6.74 |
| 45100.0 | 6.68 |
| 45100.010416666664 | 6.72 |
| 45100.020833333336 | 6.69 |
| 45100.03125 | 6.69 |
| 45100.041666666664 | 6.71 |
| 45100.052083333336 | 6.7 |
| 45100.0625 | 6.66 |
| 45100.072916666664 | 6.64 |
| 45100.083333333336 | 6.62 |
| 45100.09375 | 6.59 |
| 45100.104166666664 | 6.59 |
| 45100.114583333336 | 6.57 |
| 45100.125 | 6.57 |
| 45100.135416666664 | 6.58 |
| 45100.145833333336 | 6.58 |
| 45100.15625 | 6.57 |
| 45100.166666666664 | 6.56 |
| 45100.177083333336 | 6.54 |
| 45100.1875 | 6.53 |
| 45100.197916666664 | 6.51 |
| 45100.208333333336 | 6.46 |
| 45100.21875 | 6.44 |
| 45100.229166666664 | 6.43 |
| 45100.239583333336 | 6.43 |
| 45100.25 | 6.36 |
| 45100.260416666664 | 6.13 |
| 45100.270833333336 | 6.02 |
| 45100.28125 | 5.89 |
| 45100.291666666664 | 5.98 |
| 45100.302083333336 | 5.68 |
| 45100.3125 | 5.55 |
| 45100.322916666664 | 5.51 |
| 45100.333333333336 | 5.48 |
| 45100.34375 | 5.29 |
| 45100.354166666664 | 5.04 |
| 45100.364583333336 | 5.19 |
| 45100.375 | 5.05 |
| 45100.385416666664 | 5.03 |
| 45100.395833333336 | 5.14 |
| 45100.40625 | 5.05 |
| 45100.416666666664 | 5.29 |
| 45100.427083333336 | 5.32 |
| 45100.4375 | 5.32 |
| 45100.447916666664 | 5.53 |
| 45100.458333333336 | 5.58 |
| 45100.46875 | 5.6 |
| 45100.479166666664 | 5.62 |
| 45100.489583333336 | 5.42 |
| 45100.5 | 5.41 |
| 45100.510416666664 | 5.44 |
| 45100.520833333336 | 5.41 |
| 45100.53125 | 5.51 |
| 45100.541666666664 | 5.57 |
| 45100.552083333336 | 5.89 |
| 45100.5625 | 5.88 |
| 45100.572916666664 | 5.93 |
| 45100.583333333336 | 5.95 |
| 45100.59375 | 5.97 |
| 45100.604166666664 | 6.04 |
| 45100.614583333336 | 6.13 |
| 45100.625 | 6.12 |
| 45100.635416666664 | 6.18 |
| 45100.645833333336 | 6.26 |
| 45100.65625 | 6.29 |
| 45100.666666666664 | 6.27 |
| 45100.677083333336 | 6.3 |
| 45100.6875 | 6.36 |
| 45100.697916666664 | 6.35 |
| 45100.708333333336 | 6.35 |
| 45100.71875 | 6.39 |
| 45100.729166666664 | 6.2 |
| 45100.739583333336 | 6.2 |
| 45100.75 | 6.5 |
| 45100.760416666664 | 6.64 |
| 45100.770833333336 | 6.76 |
| 45100.78125 | 6.81 |
| 45100.791666666664 | 6.84 |
| 45100.802083333336 | 6.85 |
| 45100.8125 | 6.89 |
| 45100.822916666664 | 6.91 |
| 45100.833333333336 | 6.9 |
| 45100.84375 | 6.91 |
| 45100.854166666664 | 6.86 |
| 45100.864583333336 | 6.91 |
| 45100.875 | 6.95 |
| 45100.885416666664 | 6.89 |
| 45100.895833333336 | 6.96 |
| 45100.90625 | 6.96 |
| 45100.916666666664 | 6.93 |
| 45100.927083333336 | 6.89 |
| 45100.9375 | 6.87 |
| 45100.947916666664 | 6.84 |
| 45100.958333333336 | 6.84 |
| 45100.96875 | 6.81 |
| 45100.979166666664 | 6.81 |
| 45100.989583333336 | 6.63 |
| 45101.0 | 6.55 |
| 45101.010416666664 | 6.45 |
| 45101.020833333336 | 6.32 |
| 45101.03125 | 6.29 |
| 45101.041666666664 | 6.31 |
| 45101.052083333336 | 6.28 |
| 45101.0625 | 6.23 |
| 45101.072916666664 | 6.2 |
| 45101.083333333336 | 6.2 |
| 45101.09375 | 6.21 |
| 45101.104166666664 | 6.2 |
| 45101.114583333336 | 6.19 |
| 45101.125 | 6.13 |
| 45101.135416666664 | 6.12 |
| 45101.145833333336 | 6.09 |
| 45101.15625 | 6.12 |
| 45101.166666666664 | 6.08 |
| 45101.177083333336 | 6.05 |
| 45101.1875 | 6.06 |
| 45101.197916666664 | 6.1 |
| 45101.208333333336 | 5.97 |
| 45101.21875 | 5.91 |
| 45101.229166666664 | 6.04 |
| 45101.239583333336 | 5.97 |
| 45101.25 | 6.02 |
| 45101.260416666664 | 6.05 |
| 45101.270833333336 | 5.89 |
| 45101.28125 | 5.85 |
| 45101.291666666664 | 5.6 |
| 45101.302083333336 | 5.24 |
| 45101.3125 | 5.41 |
| 45101.322916666664 | 5.44 |
| 45101.333333333336 | 5.2 |
| 45101.34375 | 5.28 |
| 45101.354166666664 | 5.15 |
| 45101.364583333336 | 4.99 |
| 45101.375 | 5.02 |
| 45101.385416666664 | 5.01 |
| 45101.395833333336 | 5.14 |
| 45101.40625 | 5.17 |
| 45101.416666666664 | 5.13 |
| 45101.427083333336 | 5.03 |
| 45101.4375 | 4.99 |
| 45101.447916666664 | 4.96 |
| 45101.458333333336 | 4.91 |
| 45101.46875 | 4.94 |
| 45101.479166666664 | 4.9 |
| 45101.489583333336 | 4.84 |
| 45101.5 | 4.79 |
| 45101.510416666664 | 4.74 |
| 45101.520833333336 | 4.56 |
| 45101.53125 | 4.59 |
| 45101.541666666664 | 4.57 |
| 45101.552083333336 | 4.63 |
| 45101.5625 | 4.7 |
| 45101.572916666664 | 4.84 |
| 45101.583333333336 | 5.04 |
| 45101.59375 | 5.22 |
| 45101.604166666664 | 5.31 |
| 45101.614583333336 | 5.34 |
| 45101.625 | 5.37 |
| 45101.635416666664 | 5.32 |
| 45101.645833333336 | 5.32 |
| 45101.65625 | 5.3 |
| 45101.666666666664 | 5.3 |
| 45101.677083333336 | 5.3 |
| 45101.6875 | 5.29 |
| 45101.697916666664 | 5.32 |
| 45101.708333333336 | 5.38 |
| 45101.71875 | 5.37 |
| 45101.729166666664 | 5.56 |
| 45101.739583333336 | 5.65 |
| 45101.75 | 5.64 |
| 45101.760416666664 | 5.76 |
| 45101.770833333336 | 5.54 |
| 45101.78125 | 5.9 |
| 45101.791666666664 | 6.24 |
| 45101.802083333336 | 6.39 |
| 45101.8125 | 6.58 |
| 45101.822916666664 | 6.65 |
| 45101.833333333336 | 6.7 |
| 45101.84375 | 6.48 |
| 45101.854166666664 | 6.34 |
| 45101.864583333336 | 6.61 |
| 45101.875 | 6.63 |
| 45101.885416666664 | 6.56 |
| 45101.895833333336 | 6.63 |
| 45101.90625 | 6.59 |
| 45101.916666666664 | 6.65 |
| 45101.927083333336 | 6.68 |
| 45101.9375 | 6.67 |
| 45101.947916666664 | 6.63 |
| 45101.958333333336 | 6.62 |
| 45101.96875 | 6.62 |
| 45101.979166666664 | 6.57 |
| 45101.989583333336 | 6.49 |
| 45102.0 | 6.41 |
| 45102.010416666664 | 6.33 |
| 45102.020833333336 | 6.32 |
| 45102.03125 | 6.01 |
| 45102.041666666664 | 6 |
| 45102.052083333336 | 5.87 |
| 45102.0625 | 5.84 |
| 45102.072916666664 | 5.79 |
| 45102.083333333336 | 5.91 |
| 45102.09375 | 6.02 |
| 45102.104166666664 | 5.97 |
| 45102.114583333336 | 5.9 |
| 45102.125 | 5.82 |
| 45102.135416666664 | 5.77 |
| 45102.145833333336 | 5.65 |
| 45102.15625 | 5.61 |
| 45102.166666666664 | 5.52 |
| 45102.177083333336 | 5.45 |
| 45102.1875 | 5.44 |
| 45102.197916666664 | 5.48 |
| 45102.208333333336 | 5.51 |
| 45102.21875 | 5.55 |
| 45102.229166666664 | 5.59 |
| 45102.239583333336 | 5.61 |
| 45102.25 | 5.53 |
| 45102.260416666664 | 5.55 |
| 45102.270833333336 | 5.53 |
| 45102.28125 | 5.51 |
| 45102.291666666664 | 5.6 |
| 45102.302083333336 | 5.55 |
| 45102.3125 | 5.44 |
| 45102.322916666664 | 5.42 |
| 45102.333333333336 | 5.13 |
| 45102.34375 | 5.12 |
| 45102.354166666664 | 5.05 |
| 45102.364583333336 | 4.99 |
| 45102.375 | 4.68 |
| 45102.385416666664 | 4.28 |
| 45102.395833333336 | 4.07 |
| 45102.40625 | 4.28 |
| 45102.416666666664 | 4.33 |
| 45102.427083333336 | 4.49 |
| 45102.4375 | 4.47 |
| 45102.447916666664 | 4.36 |
| 45102.458333333336 | 4.26 |
| 45102.46875 | 4.23 |
| 45102.479166666664 | 4.15 |
| 45102.489583333336 | 4.19 |
| 45102.5 | 4.13 |
| 45102.510416666664 | 4.14 |
| 45102.520833333336 | 4.12 |
| 45102.53125 | 4.12 |
| 45102.541666666664 | 3.86 |
| 45102.552083333336 | 4.05 |
| 45102.5625 | 3.76 |
| 45102.572916666664 | 3.8 |
| 45102.583333333336 | 3.91 |
| 45102.59375 | 4.07 |
| 45102.604166666664 | 4.24 |
| 45102.614583333336 | 4.48 |
| 45102.625 | 4.71 |
| 45102.635416666664 | 4.76 |
| 45102.645833333336 | 4.86 |
| 45102.65625 | 4.88 |
| 45102.666666666664 | 4.92 |
| 45102.677083333336 | 5 |
| 45102.6875 | 5.06 |
| 45102.697916666664 | 5.08 |
| 45102.708333333336 | 5.05 |
| 45102.71875 | 5.07 |
| 45102.729166666664 | 5.11 |
| 45102.739583333336 | 5.16 |
| 45102.75 | 5.17 |
| 45102.760416666664 | 5.65 |
| 45102.770833333336 | 5.68 |
| 45102.78125 | 5.74 |
| 45102.791666666664 | 5.58 |
| 45102.802083333336 | 6.39 |
| 45102.8125 | 6.54 |
| 45102.822916666664 | 6.15 |
| 45102.833333333336 | 6.8 |
| 45102.84375 | 6.83 |
| 45102.854166666664 | 6.85 |
| 45102.864583333336 | 6.74 |
| 45102.875 | 6.96 |
| 45102.885416666664 | 6.71 |
| 45102.895833333336 | 6.64 |
| 45102.90625 | 6.59 |
| 45102.916666666664 | 6.54 |
| 45102.927083333336 | 6.66 |
| 45102.9375 | 6.55 |
| 45102.947916666664 | 6.58 |
| 45102.958333333336 | 6.56 |
| 45102.96875 | 6.51 |
| 45102.979166666664 | 6.48 |
| 45102.989583333336 | 6.47 |
| 45103.0 | 6.42 |
| 45103.010416666664 | 6.42 |
| 45103.020833333336 | 6.36 |
| 45103.03125 | 6.2 |
| 45103.041666666664 | 6.35 |
| 45103.052083333336 | 6.03 |
| 45103.0625 | 5.96 |
| 45103.072916666664 | 5.8 |
| 45103.083333333336 | 5.64 |
| 45103.09375 | 5.63 |
| 45103.104166666664 | 5.7 |
| 45103.114583333336 | 5.79 |
| 45103.125 | 5.72 |
| 45103.135416666664 | 5.66 |
| 45103.145833333336 | 5.66 |
| 45103.15625 | 5.66 |
| 45103.166666666664 | 5.56 |
| 45103.177083333336 | 5.52 |
| 45103.1875 | 5.51 |
| 45103.197916666664 | 5.48 |
| 45103.208333333336 | 5.37 |
| 45103.21875 | 5.46 |
| 45103.229166666664 | 5.4 |
| 45103.239583333336 | 5.4 |
| 45103.25 | 5.31 |
| 45103.260416666664 | 5.43 |
| 45103.270833333336 | 5.45 |
| 45103.28125 | 5.28 |
| 45103.291666666664 | 5.37 |
| 45103.302083333336 | 5.3 |
| 45103.3125 | 5.21 |
| 45103.322916666664 | 5.22 |
| 45103.333333333336 | 5.29 |
| 45103.34375 | 5.22 |
| 45103.354166666664 | 5.07 |
| 45103.364583333336 | 4.85 |
| 45103.375 | 4.66 |
| 45103.385416666664 | 4.39 |
| 45103.395833333336 | 4 |
| 45103.40625 | 4.14 |
| 45103.416666666664 | 3.92 |
| 45103.427083333336 | 3.82 |
| 45103.4375 | 3.97 |
| 45103.447916666664 | 4.52 |
| 45103.458333333336 | 4.57 |
| 45103.46875 | 4.51 |
| 45103.479166666664 | 4.41 |
| 45103.489583333336 | 4.39 |
| 45103.5 | 4.36 |
| 45103.510416666664 | 4.39 |
| 45103.520833333336 | 4.44 |
| 45103.53125 | 4.49 |
| 45103.541666666664 | 4.31 |
| 45103.552083333336 | 4.22 |
| 45103.5625 | 4.18 |
| 45103.572916666664 | 4.16 |
| 45103.583333333336 | 4.21 |
| 45103.59375 | 4.28 |
| 45103.604166666664 | 4.33 |
| 45103.614583333336 | 4.63 |
| 45103.625 | 4.76 |
| 45103.635416666664 | 4.83 |
| 45103.645833333336 | 4.96 |
| 45103.65625 | 5.08 |
| 45103.666666666664 | 5.24 |
| 45103.677083333336 | 5.27 |
| 45103.6875 | 5.37 |
| 45103.697916666664 | 5.47 |
| 45103.708333333336 | 5.48 |
| 45103.71875 | 5.47 |
| 45103.729166666664 | 5.61 |
| 45103.739583333336 | 5.69 |
| 45103.75 | 5.75 |
| 45103.760416666664 | 5.7 |
| 45103.770833333336 | 5.75 |
| 45103.78125 | 5.78 |
| 45103.791666666664 | 5.84 |
| 45103.802083333336 | 5.81 |
| 45103.8125 | 5.82 |
| 45103.822916666664 | 5.77 |
| 45103.833333333336 | 5.88 |
| 45103.84375 | 6.01 |
| 45103.854166666664 | 5.81 |
| 45103.864583333336 | 5.91 |
| 45103.875 | 6.09 |
| 45103.885416666664 | 6.29 |
| 45103.895833333336 | 6.35 |
| 45103.90625 | 6.35 |
| 45103.916666666664 | 6.29 |
| 45103.927083333336 | 6.06 |
| 45103.9375 | 6.08 |
| 45103.947916666664 | 6.11 |
| 45103.958333333336 | 6.03 |
| 45103.96875 | 6.21 |
| 45103.979166666664 | 6.15 |
| 45103.989583333336 | 6.12 |
| 45104.0 | 6.08 |
| 45104.010416666664 | 6.05 |
| 45104.020833333336 | 6.03 |
| 45104.03125 | 6 |
| 45104.041666666664 | 5.95 |
| 45104.052083333336 | 5.88 |
| 45104.0625 | 5.82 |
| 45104.072916666664 | 5.77 |
| 45104.083333333336 | 5.54 |
| 45104.09375 | 5.48 |
| 45104.104166666664 | 5.27 |
| 45104.114583333336 | 5.29 |
| 45104.125 | 5.17 |
| 45104.135416666664 | 5.12 |
| 45104.145833333336 | 5.17 |
| 45104.15625 | 5.19 |
| 45104.166666666664 | 5.25 |
| 45104.177083333336 | 5.21 |
| 45104.1875 | 5.18 |
| 45104.197916666664 | 5.19 |
| 45104.208333333336 | 5.17 |
| 45104.21875 | 5.09 |
| 45104.229166666664 | 5.15 |
| 45104.239583333336 | 5.07 |
| 45104.25 | 5.09 |
| 45104.260416666664 | 5.05 |
| 45104.270833333336 | 5.03 |
| 45104.28125 | 5.09 |
| 45104.291666666664 | 5.08 |
| 45104.302083333336 | 5.1 |
| 45104.3125 | 5.01 |
| 45104.322916666664 | 4.87 |
| 45104.333333333336 | 4.75 |
| 45104.34375 | 4.73 |
| 45104.354166666664 | 4.9 |
| 45104.364583333336 | 4.85 |
| 45104.375 | 4.85 |
| 45104.385416666664 | 4.79 |
| 45104.395833333336 | 4.7 |
| 45104.40625 | 4.68 |
| 45104.416666666664 | 4.65 |
| 45104.427083333336 | 4.69 |
| 45104.4375 | 4.54 |
| 45104.447916666664 | 4.45 |
| 45104.458333333336 | 4.48 |
| 45104.46875 | 4.59 |
| 45104.479166666664 | 4.64 |
| 45104.489583333336 | 4.59 |
| 45104.5 | 4.56 |
| 45104.510416666664 | 4.48 |
| 45104.520833333336 | 4.41 |
| 45104.53125 | 4.34 |
| 45104.541666666664 | 4.23 |
| 45104.552083333336 | 4.47 |
| 45104.5625 | 4.7 |
| 45104.572916666664 | 4.64 |
| 45104.583333333336 | 4.65 |
| 45104.59375 | 4.83 |
| 45104.604166666664 | 4.74 |
| 45104.614583333336 | 4.65 |
| 45104.625 | 4.82 |
| 45104.635416666664 | 4.85 |
| 45104.645833333336 | 4.83 |
| 45104.65625 | 4.64 |
| 45104.666666666664 | 4.54 |
| 45104.677083333336 | 4.48 |
| 45104.6875 | 4.66 |
| 45104.697916666664 | 4.88 |
| 45104.708333333336 | 5.12 |
| 45104.71875 | 5.21 |
| 45104.729166666664 | 5.4 |
| 45104.739583333336 | 5.52 |
| 45104.75 | 5.53 |
| 45104.760416666664 | 5.65 |
| 45104.770833333336 | 5.61 |
| 45104.78125 | 5.7 |
| 45104.791666666664 | 5.76 |
| 45104.802083333336 | 5.87 |
| 45104.8125 | 5.81 |
| 45104.822916666664 | 5.85 |
| 45104.833333333336 | 5.97 |
| 45104.84375 | 6.03 |
| 45104.854166666664 | 6.01 |
| 45104.864583333336 | 6.11 |
| 45104.875 | 5.66 |
| 45104.885416666664 | 5.97 |
| 45104.895833333336 | 6 |
| 45104.90625 | 6.02 |
| 45104.916666666664 | 6.27 |
| 45104.927083333336 | 6.35 |
| 45104.9375 | 6.32 |
| 45104.947916666664 | 6.3 |
| 45104.958333333336 | 6.25 |
| 45104.96875 | 5.95 |
| 45104.979166666664 | 5.85 |
| 45104.989583333336 | 5.93 |
| 45105.0 | 5.78 |
| 45105.010416666664 | 5.78 |
| 45105.020833333336 | 5.66 |
| 45105.03125 | 5.66 |
| 45105.041666666664 | 5.55 |
| 45105.052083333336 | 5.48 |
| 45105.0625 | 5.51 |
| 45105.072916666664 | 5.48 |
| 45105.083333333336 | 5.48 |
| 45105.09375 | 5.41 |
| 45105.104166666664 | 5.43 |
| 45105.114583333336 | 5.39 |
| 45105.125 | 5.29 |
| 45105.135416666664 | 5.2 |
| 45105.145833333336 | 5.27 |
| 45105.15625 | 5.01 |
| 45105.166666666664 | 4.94 |
| 45105.177083333336 | 4.86 |
| 45105.1875 | 4.78 |
| 45105.197916666664 | 4.86 |
| 45105.208333333336 | 5 |
| 45105.21875 | 4.98 |
| 45105.229166666664 | 4.96 |
| 45105.239583333336 | 4.96 |
| 45105.25 | 4.92 |
| 45105.260416666664 | 4.87 |
| 45105.270833333336 | 4.89 |
| 45105.28125 | 4.8 |
| 45105.291666666664 | 4.82 |
| 45105.302083333336 | 4.75 |
| 45105.3125 | 4.74 |
| 45105.322916666664 | 4.83 |
| 45105.333333333336 | 4.76 |
| 45105.34375 | 4.71 |
| 45105.354166666664 | 4.72 |
| 45105.364583333336 | 4.61 |
| 45105.375 | 4.65 |
| 45105.385416666664 | 4.63 |
| 45105.395833333336 | 4.69 |
| 45105.40625 | 4.73 |
| 45105.416666666664 | 4.55 |
| 45105.427083333336 | 4.46 |
| 45105.4375 | 4.24 |
| 45105.447916666664 | 4.08 |
| 45105.458333333336 | 4.1 |
| 45105.46875 | 3.9 |
| 45105.479166666664 | 3.81 |
| 45105.489583333336 | 3.75 |
| 45105.5 | 3.81 |
| 45105.510416666664 | 3.91 |
| 45105.520833333336 | 3.94 |
| 45105.53125 | 3.96 |
| 45105.541666666664 | 4.02 |
| 45105.552083333336 | 4.06 |
| 45105.5625 | 4.02 |
| 45105.572916666664 | 4.08 |
| 45105.583333333336 | 4.13 |
| 45105.59375 | 4.15 |
| 45105.604166666664 | 4.17 |
| 45105.614583333336 | 4.16 |
| 45105.625 | 4.21 |
| 45105.635416666664 | 4.24 |
| 45105.645833333336 | 4.2 |
| 45105.65625 | 3.81 |
| 45105.666666666664 | 3.75 |
| 45105.677083333336 | 3.91 |
| 45105.6875 | 4.08 |
| 45105.697916666664 | 4.21 |
| 45105.708333333336 | 4.38 |
| 45105.71875 | 4.61 |
| 45105.729166666664 | 4.65 |
| 45105.739583333336 | 4.78 |
| 45105.75 | 4.86 |
| 45105.760416666664 | 4.97 |
| 45105.770833333336 | 5.06 |
| 45105.78125 | 5.19 |
| 45105.791666666664 | 5.19 |
| 45105.802083333336 | 5.25 |
| 45105.8125 | 5.38 |
| 45105.822916666664 | 5.42 |
| 45105.833333333336 | 5.47 |
| 45105.84375 | 5.51 |
| 45105.854166666664 | 5.55 |
| 45105.864583333336 | 5.6 |
| 45105.875 | 5.58 |
| 45105.885416666664 | 5.59 |
| 45105.895833333336 | 5.35 |
| 45105.90625 | 5.49 |
| 45105.916666666664 | 5.47 |
| 45105.927083333336 | 5.57 |
| 45105.9375 | 5.67 |
| 45105.947916666664 | 5.57 |
| 45105.958333333336 | 5.81 |
| 45105.96875 | 5.93 |
| 45105.979166666664 | 5.9 |
| 45105.989583333336 | 5.78 |
| 45106.0 | 5.67 |
| 45106.010416666664 | 5.56 |
| 45106.020833333336 | 5.4 |
| 45106.03125 | 5.41 |
| 45106.041666666664 | 5.15 |
| 45106.052083333336 | 5.31 |
| 45106.0625 | 5.19 |
| 45106.072916666664 | 5.16 |
| 45106.083333333336 | 5.27 |
| 45106.09375 | 5.18 |
| 45106.104166666664 | 5.14 |
| 45106.114583333336 | 5.11 |
| 45106.125 | 5.1 |
| 45106.135416666664 | 5.06 |
| 45106.145833333336 | 5 |
| 45106.15625 | 4.72 |
| 45106.166666666664 | 4.71 |
| 45106.177083333336 | 4.69 |
| 45106.1875 | 4.58 |
| 45106.197916666664 | 4.54 |
| 45106.208333333336 | 4.46 |
| 45106.21875 | 4.46 |
| 45106.229166666664 | 4.45 |
| 45106.239583333336 | 4.48 |
| 45106.25 | 4.39 |
| 45106.260416666664 | 4.38 |
| 45106.270833333336 | 4.4 |
| 45106.28125 | 4.3 |
| 45106.291666666664 | 4.29 |
| 45106.302083333336 | 4.24 |
| 45106.3125 | 4.17 |
| 45106.322916666664 | 4.25 |
| 45106.333333333336 | 4.22 |
| 45106.34375 | 4.16 |
| 45106.354166666664 | 4.15 |
| 45106.364583333336 | 4.07 |
| 45106.375 | 4.06 |
| 45106.385416666664 | 3.98 |
| 45106.395833333336 | 3.99 |
| 45106.40625 | 3.9 |
| 45106.416666666664 | 4.02 |
| 45106.427083333336 | 4.08 |
| 45106.4375 | 4.04 |
| 45106.447916666664 | 3.98 |
| 45106.458333333336 | 3.81 |
| 45106.46875 | 3.73 |
| 45106.479166666664 | 3.52 |
| 45106.489583333336 | 3.37 |
| 45106.5 | 3.38 |
| 45106.510416666664 | 3.43 |
| 45106.520833333336 | 3.52 |
| 45106.53125 | 3.64 |
| 45106.541666666664 | 3.76 |
| 45106.552083333336 | 3.79 |
| 45106.5625 | 3.89 |
| 45106.572916666664 | 3.93 |
| 45106.583333333336 | 3.95 |
| 45106.59375 | 3.92 |
| 45106.604166666664 | 3.98 |
| 45106.614583333336 | 4.02 |
| 45106.625 | 4.07 |
| 45106.635416666664 | 4.09 |
| 45106.645833333336 | 4.26 |
| 45106.65625 | 4.38 |
| 45106.666666666664 | 4.1 |
| 45106.677083333336 | 4.54 |
| 45106.6875 | 4.15 |
| 45106.697916666664 | 3.99 |
| 45106.708333333336 | 3.86 |
| 45106.71875 | 3.94 |
| 45106.729166666664 | 3.99 |
| 45106.739583333336 | 4.17 |
| 45106.75 | 4.36 |
| 45106.760416666664 | 4.52 |
| 45106.770833333336 | 4.65 |
| 45106.78125 | 4.68 |
| 45106.791666666664 | 4.62 |
| 45106.802083333336 | 4.8 |
| 45106.8125 | 4.84 |
| 45106.822916666664 | 4.96 |
| 45106.833333333336 | 5.03 |
| 45106.84375 | 5.16 |
| 45106.854166666664 | 5.23 |
| 45106.864583333336 | 5.27 |
| 45106.875 | 5.32 |
| 45106.885416666664 | 5.33 |
| 45106.895833333336 | 5.33 |
| 45106.90625 | 5.44 |
| 45106.916666666664 | 5.3 |
| 45106.927083333336 | 5.35 |
| 45106.9375 | 5.26 |
| 45106.947916666664 | 5.19 |
| 45106.958333333336 | 5.24 |
| 45106.96875 | 5.32 |
| 45106.979166666664 | 5.13 |
| 45106.989583333336 | 5.5 |
| 45107.0 | 5.55 |
| 45107.010416666664 | 5.41 |
| 45107.020833333336 | 5.27 |
| 45107.03125 | 5.2 |
| 45107.041666666664 | 5.2 |
| 45107.052083333336 | 5.03 |
| 45107.0625 | 4.89 |
| 45107.072916666664 | 4.72 |
| 45107.083333333336 | 4.65 |
| 45107.09375 | 4.57 |
| 45107.104166666664 | 4.54 |
| 45107.114583333336 | 4.71 |
| 45107.125 | 4.73 |
| 45107.135416666664 | 4.76 |
| 45107.145833333336 | 4.83 |
| 45107.15625 | 4.87 |
| 45107.166666666664 | 4.85 |
| 45107.177083333336 | 4.85 |
| 45107.1875 | 4.81 |
| 45107.197916666664 | 4.64 |
| 45107.208333333336 | 4.6 |
| 45107.21875 | 4.47 |
| 45107.229166666664 | 4.35 |
| 45107.239583333336 | 4.23 |
| 45107.25 | 4.19 |
| 45107.260416666664 | 4.19 |
| 45107.270833333336 | 4.25 |
| 45107.28125 | 4.37 |
| 45107.291666666664 | 4.32 |
| 45107.302083333336 | 4.15 |
| 45107.3125 | 4.17 |
| 45107.322916666664 | 4.19 |
| 45107.333333333336 | 4.27 |
| 45107.34375 | 4.25 |
| 45107.354166666664 | 4.23 |
| 45107.364583333336 | 4.19 |
| 45107.375 | 4.11 |
| 45107.385416666664 | 4.15 |
| 45107.395833333336 | 4.08 |
| 45107.40625 | 4.18 |
| 45107.416666666664 | 4.1 |
| 45107.427083333336 | 4.01 |
| 45107.4375 | 4.05 |
| 45107.447916666664 | 4.1 |
| 45107.458333333336 | 4.16 |
| 45107.46875 | 4.17 |
| 45107.479166666664 | 4.04 |
| 45107.489583333336 | 3.88 |
| 45107.5 | 3.9 |
| 45107.510416666664 | 3.91 |
| 45107.520833333336 | 3.47 |
| 45107.53125 | 3.66 |
| 45107.541666666664 | 3.64 |
| 45107.552083333336 | 3.75 |
| 45107.5625 | 3.78 |
| 45107.572916666664 | 3.96 |
| 45107.583333333336 | 4.03 |
| 45107.59375 | 4.19 |
| 45107.604166666664 | 4.28 |
| 45107.614583333336 | 4.31 |
| 45107.625 | 4.36 |
| 45107.635416666664 | 4.37 |
| 45107.645833333336 | 4.53 |
| 45107.65625 | 4.67 |
| 45107.666666666664 | 4.81 |
| 45107.677083333336 | 5.06 |
| 45107.6875 | 5.14 |
| 45107.697916666664 | 5.29 |
| 45107.708333333336 | 4.87 |
| 45107.71875 | 4.7 |
| 45107.729166666664 | 4.46 |
| 45107.739583333336 | 4.46 |
| 45107.75 | 4.3 |
| 45107.760416666664 | 4.45 |
| 45107.770833333336 | 4.53 |
| 45107.78125 | 4.58 |
| 45107.791666666664 | 4.7 |
| 45107.802083333336 | 4.71 |
| 45107.8125 | 4.73 |
| 45107.822916666664 | 4.72 |
| 45107.833333333336 | 4.73 |
| 45107.84375 | 4.77 |
| 45107.854166666664 | 4.81 |
| 45107.864583333336 | 4.94 |
| 45107.875 | 5 |
| 45107.885416666664 | 5.11 |
| 45107.895833333336 | 5.16 |
| 45107.90625 | 5.19 |
| 45107.916666666664 | 5.28 |
| 45107.927083333336 | 5.28 |
| 45107.9375 | 5.25 |
| 45107.947916666664 | 5.26 |
| 45107.958333333336 | 5.22 |
| 45107.96875 | 5.14 |
| 45107.979166666664 | 5.01 |
| 45107.989583333336 | 5.05 |
| 45108.0 | 5.03 |
| 45108.010416666664 | 5 |
| 45108.020833333336 | 4.83 |
| 45108.03125 | 4.85 |
| 45108.041666666664 | 4.79 |
| 45108.052083333336 | 4.66 |
| 45108.0625 | 4.75 |
| 45108.072916666664 | 4.67 |
| 45108.083333333336 | 4.64 |
| 45108.09375 | 4.3 |
| 45108.104166666664 | 4.16 |
| 45108.114583333336 | 3.86 |
| 45108.125 | 3.9 |
| 45108.135416666664 | 4.12 |
| 45108.145833333336 | 3.94 |
| 45108.15625 | 4.13 |
| 45108.166666666664 | 4.3 |
| 45108.177083333336 | 4.4 |
| 45108.1875 | 4.42 |
| 45108.197916666664 | 4.43 |
| 45108.208333333336 | 4.45 |
| 45108.21875 | 4.49 |
| 45108.229166666664 | 4.46 |
| 45108.239583333336 | 4.34 |
| 45108.25 | 4.39 |
| 45108.260416666664 | 4.13 |
| 45108.270833333336 | 4.06 |
| 45108.28125 | 4 |
| 45108.291666666664 | 3.94 |
| 45108.302083333336 | 3.9 |
| 45108.3125 | 3.84 |
| 45108.322916666664 | 3.94 |
| 45108.333333333336 | 3.9 |
| 45108.34375 | 3.89 |
| 45108.354166666664 | 3.85 |
| 45108.364583333336 | 3.8 |
| 45108.375 | 3.8 |
| 45108.385416666664 | 3.79 |
| 45108.395833333336 | 3.76 |
| 45108.40625 | 3.73 |
| 45108.416666666664 | 3.7 |
| 45108.427083333336 | 3.72 |
| 45108.4375 | 3.71 |
| 45108.447916666664 | 3.7 |
| 45108.458333333336 | 3.74 |
| 45108.46875 | 3.64 |
| 45108.479166666664 | 3.71 |
| 45108.489583333336 | 3.58 |
| 45108.5 | 3.82 |
| 45108.510416666664 | 3.76 |
| 45108.520833333336 | 3.66 |
| 45108.53125 | 3.53 |
| 45108.541666666664 | 3.46 |
| 45108.552083333336 | 3.47 |
| 45108.5625 | 3.54 |
| 45108.572916666664 | 3.63 |
| 45108.583333333336 | 3.7 |
| 45108.59375 | 3.76 |
| 45108.604166666664 | 3.95 |
| 45108.614583333336 | 4.1 |
| 45108.625 | 4.32 |
| 45108.635416666664 | 4.56 |
| 45108.645833333336 | 4.66 |
| 45108.65625 | 4.83 |
| 45108.666666666664 | 4.93 |
| 45108.677083333336 | 5.18 |
| 45108.6875 | 5.33 |
| 45108.697916666664 | 5.66 |
| 45108.708333333336 | 5.97 |
| 45108.71875 | 6.02 |
| 45108.729166666664 | 6.17 |
| 45108.739583333336 | 6.26 |
| 45108.75 | 6.07 |
| 45108.760416666664 | 5.8 |
| 45108.770833333336 | 5.4 |
| 45108.78125 | 5.31 |
| 45108.791666666664 | 5.24 |
| 45108.802083333336 | 5.16 |
| 45108.8125 | 5.11 |
| 45108.822916666664 | 5.13 |
| 45108.833333333336 | 5.11 |
| 45108.84375 | 5.05 |
| 45108.854166666664 | 5.07 |
| 45108.864583333336 | 5.04 |
| 45108.875 | 5.1 |
| 45108.885416666664 | 5.13 |
| 45108.895833333336 | 5.11 |
| 45108.90625 | 5.18 |
| 45108.916666666664 | 5.19 |
| 45108.927083333336 | 5.28 |
| 45108.9375 | 5.35 |
| 45108.947916666664 | 5.33 |
| 45108.958333333336 | 5.38 |
| 45108.96875 | 5.33 |
| 45108.979166666664 | 5.25 |
| 45108.989583333336 | 5.24 |
| 45109.0 | 5.12 |
| 45109.010416666664 | 5.08 |
| 45109.020833333336 | 4.92 |
| 45109.03125 | 5.04 |
| 45109.041666666664 | 4.99 |
| 45109.052083333336 | 4.96 |
| 45109.0625 | 5 |
| 45109.072916666664 | 4.96 |
| 45109.083333333336 | 4.87 |
| 45109.09375 | 4.71 |